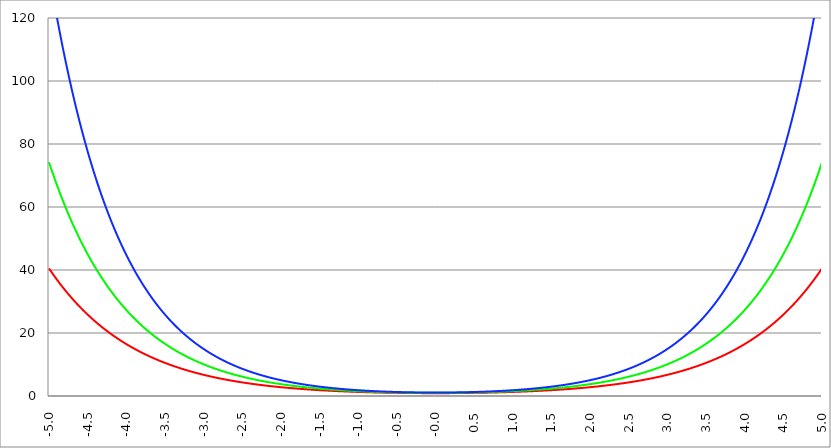
| Category | Series 1 | Series 0 | Series 2 |
|---|---|---|---|
| -5.0 | 40.513 | 74.21 | 134.583 |
| -4.995 | 40.331 | 73.84 | 133.845 |
| -4.99 | 40.15 | 73.472 | 133.111 |
| -4.985 | 39.97 | 73.105 | 132.38 |
| -4.98 | 39.79 | 72.741 | 131.654 |
| -4.975 | 39.612 | 72.378 | 130.932 |
| -4.97 | 39.434 | 72.017 | 130.214 |
| -4.965000000000001 | 39.257 | 71.658 | 129.5 |
| -4.960000000000001 | 39.081 | 71.3 | 128.79 |
| -4.955000000000001 | 38.905 | 70.945 | 128.083 |
| -4.950000000000001 | 38.73 | 70.591 | 127.381 |
| -4.945000000000001 | 38.557 | 70.239 | 126.682 |
| -4.940000000000001 | 38.384 | 69.889 | 125.987 |
| -4.935000000000001 | 38.211 | 69.54 | 125.296 |
| -4.930000000000001 | 38.04 | 69.193 | 124.609 |
| -4.925000000000002 | 37.869 | 68.848 | 123.926 |
| -4.920000000000002 | 37.699 | 68.505 | 123.246 |
| -4.915000000000002 | 37.53 | 68.163 | 122.57 |
| -4.910000000000002 | 37.361 | 67.823 | 121.898 |
| -4.905000000000002 | 37.194 | 67.485 | 121.229 |
| -4.900000000000002 | 37.027 | 67.149 | 120.564 |
| -4.895000000000002 | 36.861 | 66.814 | 119.903 |
| -4.890000000000002 | 36.695 | 66.481 | 119.245 |
| -4.885000000000002 | 36.53 | 66.149 | 118.591 |
| -4.880000000000002 | 36.366 | 65.819 | 117.941 |
| -4.875000000000003 | 36.203 | 65.491 | 117.294 |
| -4.870000000000003 | 36.041 | 65.164 | 116.651 |
| -4.865000000000003 | 35.879 | 64.839 | 116.011 |
| -4.860000000000003 | 35.718 | 64.516 | 115.375 |
| -4.855000000000003 | 35.558 | 64.194 | 114.742 |
| -4.850000000000003 | 35.398 | 63.874 | 114.113 |
| -4.845000000000003 | 35.239 | 63.556 | 113.487 |
| -4.840000000000003 | 35.081 | 63.239 | 112.864 |
| -4.835000000000003 | 34.923 | 62.923 | 112.245 |
| -4.830000000000004 | 34.767 | 62.609 | 111.63 |
| -4.825000000000004 | 34.611 | 62.297 | 111.017 |
| -4.820000000000004 | 34.455 | 61.987 | 110.409 |
| -4.815000000000004 | 34.301 | 61.677 | 109.803 |
| -4.810000000000004 | 34.147 | 61.37 | 109.201 |
| -4.805000000000004 | 33.993 | 61.064 | 108.602 |
| -4.800000000000004 | 33.841 | 60.759 | 108.006 |
| -4.795000000000004 | 33.689 | 60.456 | 107.414 |
| -4.790000000000004 | 33.538 | 60.155 | 106.825 |
| -4.785000000000004 | 33.387 | 59.855 | 106.239 |
| -4.780000000000004 | 33.237 | 59.556 | 105.656 |
| -4.775000000000004 | 33.088 | 59.259 | 105.077 |
| -4.770000000000004 | 32.94 | 58.964 | 104.5 |
| -4.765000000000005 | 32.792 | 58.67 | 103.927 |
| -4.760000000000005 | 32.645 | 58.377 | 103.357 |
| -4.755000000000005 | 32.498 | 58.086 | 102.79 |
| -4.750000000000005 | 32.352 | 57.796 | 102.227 |
| -4.745000000000005 | 32.207 | 57.508 | 101.666 |
| -4.740000000000005 | 32.063 | 57.221 | 101.108 |
| -4.735000000000005 | 31.919 | 56.936 | 100.554 |
| -4.730000000000005 | 31.775 | 56.652 | 100.002 |
| -4.725000000000006 | 31.633 | 56.37 | 99.454 |
| -4.720000000000006 | 31.491 | 56.089 | 98.908 |
| -4.715000000000006 | 31.35 | 55.809 | 98.366 |
| -4.710000000000006 | 31.209 | 55.531 | 97.826 |
| -4.705000000000006 | 31.069 | 55.254 | 97.29 |
| -4.700000000000006 | 30.929 | 54.978 | 96.756 |
| -4.695000000000006 | 30.79 | 54.704 | 96.226 |
| -4.690000000000006 | 30.652 | 54.431 | 95.698 |
| -4.685000000000007 | 30.515 | 54.16 | 95.173 |
| -4.680000000000007 | 30.378 | 53.89 | 94.651 |
| -4.675000000000007 | 30.241 | 53.621 | 94.132 |
| -4.670000000000007 | 30.106 | 53.354 | 93.616 |
| -4.665000000000007 | 29.971 | 53.088 | 93.102 |
| -4.660000000000007 | 29.836 | 52.823 | 92.592 |
| -4.655000000000007 | 29.702 | 52.559 | 92.084 |
| -4.650000000000007 | 29.569 | 52.297 | 91.579 |
| -4.645000000000007 | 29.436 | 52.036 | 91.076 |
| -4.640000000000008 | 29.304 | 51.777 | 90.577 |
| -4.635000000000008 | 29.173 | 51.519 | 90.08 |
| -4.630000000000008 | 29.042 | 51.262 | 89.586 |
| -4.625000000000008 | 28.911 | 51.006 | 89.095 |
| -4.620000000000008 | 28.782 | 50.752 | 88.606 |
| -4.615000000000008 | 28.652 | 50.499 | 88.12 |
| -4.610000000000008 | 28.524 | 50.247 | 87.637 |
| -4.605000000000008 | 28.396 | 49.996 | 87.156 |
| -4.600000000000008 | 28.268 | 49.747 | 86.678 |
| -4.595000000000009 | 28.142 | 49.499 | 86.203 |
| -4.590000000000009 | 28.015 | 49.252 | 85.73 |
| -4.585000000000009 | 27.89 | 49.007 | 85.26 |
| -4.580000000000009 | 27.764 | 48.762 | 84.792 |
| -4.57500000000001 | 27.64 | 48.519 | 84.327 |
| -4.57000000000001 | 27.516 | 48.277 | 83.865 |
| -4.565000000000009 | 27.392 | 48.037 | 83.405 |
| -4.560000000000009 | 27.269 | 47.797 | 82.947 |
| -4.555000000000009 | 27.147 | 47.559 | 82.493 |
| -4.55000000000001 | 27.025 | 47.321 | 82.04 |
| -4.54500000000001 | 26.904 | 47.086 | 81.59 |
| -4.54000000000001 | 26.783 | 46.851 | 81.143 |
| -4.53500000000001 | 26.663 | 46.617 | 80.698 |
| -4.53000000000001 | 26.543 | 46.385 | 80.255 |
| -4.52500000000001 | 26.424 | 46.153 | 79.815 |
| -4.52000000000001 | 26.306 | 45.923 | 79.377 |
| -4.51500000000001 | 26.188 | 45.694 | 78.942 |
| -4.51000000000001 | 26.07 | 45.466 | 78.509 |
| -4.505000000000011 | 25.953 | 45.24 | 78.078 |
| -4.500000000000011 | 25.837 | 45.014 | 77.65 |
| -4.495000000000011 | 25.721 | 44.79 | 77.224 |
| -4.490000000000011 | 25.605 | 44.566 | 76.801 |
| -4.485000000000011 | 25.49 | 44.344 | 76.38 |
| -4.480000000000011 | 25.376 | 44.123 | 75.961 |
| -4.475000000000011 | 25.262 | 43.903 | 75.544 |
| -4.470000000000011 | 25.149 | 43.684 | 75.13 |
| -4.465000000000011 | 25.036 | 43.466 | 74.718 |
| -4.460000000000011 | 24.924 | 43.25 | 74.308 |
| -4.455000000000012 | 24.812 | 43.034 | 73.9 |
| -4.450000000000012 | 24.701 | 42.819 | 73.495 |
| -4.445000000000012 | 24.59 | 42.606 | 73.092 |
| -4.440000000000012 | 24.479 | 42.393 | 72.691 |
| -4.435000000000012 | 24.37 | 42.182 | 72.293 |
| -4.430000000000012 | 24.26 | 41.972 | 71.896 |
| -4.425000000000012 | 24.151 | 41.762 | 71.502 |
| -4.420000000000012 | 24.043 | 41.554 | 71.11 |
| -4.415000000000012 | 23.935 | 41.347 | 70.72 |
| -4.410000000000013 | 23.828 | 41.141 | 70.332 |
| -4.405000000000013 | 23.721 | 40.936 | 69.946 |
| -4.400000000000013 | 23.614 | 40.732 | 69.562 |
| -4.395000000000013 | 23.508 | 40.528 | 69.181 |
| -4.390000000000013 | 23.403 | 40.326 | 68.802 |
| -4.385000000000013 | 23.298 | 40.125 | 68.424 |
| -4.380000000000013 | 23.193 | 39.925 | 68.049 |
| -4.375000000000013 | 23.089 | 39.726 | 67.676 |
| -4.370000000000013 | 22.986 | 39.528 | 67.305 |
| -4.365000000000013 | 22.883 | 39.331 | 66.936 |
| -4.360000000000014 | 22.78 | 39.135 | 66.568 |
| -4.355000000000014 | 22.678 | 38.94 | 66.203 |
| -4.350000000000014 | 22.576 | 38.746 | 65.84 |
| -4.345000000000014 | 22.475 | 38.553 | 65.479 |
| -4.340000000000014 | 22.374 | 38.36 | 65.12 |
| -4.335000000000014 | 22.274 | 38.169 | 64.763 |
| -4.330000000000014 | 22.174 | 37.979 | 64.408 |
| -4.325000000000014 | 22.074 | 37.789 | 64.055 |
| -4.320000000000014 | 21.975 | 37.601 | 63.703 |
| -4.315000000000015 | 21.877 | 37.413 | 63.354 |
| -4.310000000000015 | 21.778 | 37.227 | 63.007 |
| -4.305000000000015 | 21.681 | 37.041 | 62.661 |
| -4.300000000000015 | 21.583 | 36.857 | 62.317 |
| -4.295000000000015 | 21.487 | 36.673 | 61.976 |
| -4.290000000000015 | 21.39 | 36.49 | 61.636 |
| -4.285000000000015 | 21.294 | 36.308 | 61.298 |
| -4.280000000000015 | 21.199 | 36.127 | 60.962 |
| -4.275000000000015 | 21.104 | 35.947 | 60.627 |
| -4.270000000000015 | 21.009 | 35.768 | 60.295 |
| -4.265000000000016 | 20.915 | 35.589 | 59.964 |
| -4.260000000000016 | 20.821 | 35.412 | 59.635 |
| -4.255000000000016 | 20.728 | 35.236 | 59.308 |
| -4.250000000000016 | 20.635 | 35.06 | 58.983 |
| -4.245000000000016 | 20.542 | 34.885 | 58.66 |
| -4.240000000000016 | 20.45 | 34.711 | 58.338 |
| -4.235000000000016 | 20.358 | 34.538 | 58.018 |
| -4.230000000000016 | 20.267 | 34.366 | 57.7 |
| -4.225000000000017 | 20.176 | 34.195 | 57.383 |
| -4.220000000000017 | 20.085 | 34.024 | 57.069 |
| -4.215000000000017 | 19.995 | 33.854 | 56.756 |
| -4.210000000000017 | 19.906 | 33.686 | 56.445 |
| -4.205000000000017 | 19.816 | 33.518 | 56.135 |
| -4.200000000000017 | 19.727 | 33.351 | 55.827 |
| -4.195000000000017 | 19.639 | 33.184 | 55.521 |
| -4.190000000000017 | 19.551 | 33.019 | 55.217 |
| -4.185000000000017 | 19.463 | 32.854 | 54.914 |
| -4.180000000000017 | 19.376 | 32.691 | 54.613 |
| -4.175000000000018 | 19.289 | 32.528 | 54.313 |
| -4.170000000000018 | 19.203 | 32.365 | 54.015 |
| -4.165000000000018 | 19.116 | 32.204 | 53.719 |
| -4.160000000000018 | 19.031 | 32.044 | 53.424 |
| -4.155000000000018 | 18.945 | 31.884 | 53.132 |
| -4.150000000000018 | 18.86 | 31.725 | 52.84 |
| -4.145000000000018 | 18.776 | 31.567 | 52.55 |
| -4.140000000000018 | 18.692 | 31.409 | 52.262 |
| -4.135000000000018 | 18.608 | 31.253 | 51.976 |
| -4.130000000000019 | 18.524 | 31.097 | 51.691 |
| -4.125000000000019 | 18.441 | 30.942 | 51.407 |
| -4.120000000000019 | 18.359 | 30.788 | 51.125 |
| -4.115000000000019 | 18.276 | 30.634 | 50.845 |
| -4.110000000000019 | 18.194 | 30.482 | 50.566 |
| -4.105000000000019 | 18.113 | 30.33 | 50.289 |
| -4.100000000000019 | 18.031 | 30.178 | 50.013 |
| -4.095000000000019 | 17.951 | 30.028 | 49.739 |
| -4.090000000000019 | 17.87 | 29.878 | 49.466 |
| -4.085000000000019 | 17.79 | 29.729 | 49.195 |
| -4.08000000000002 | 17.71 | 29.581 | 48.925 |
| -4.07500000000002 | 17.631 | 29.434 | 48.657 |
| -4.07000000000002 | 17.552 | 29.287 | 48.39 |
| -4.06500000000002 | 17.473 | 29.141 | 48.125 |
| -4.06000000000002 | 17.395 | 28.996 | 47.861 |
| -4.05500000000002 | 17.317 | 28.851 | 47.598 |
| -4.05000000000002 | 17.239 | 28.707 | 47.337 |
| -4.04500000000002 | 17.162 | 28.564 | 47.078 |
| -4.04000000000002 | 17.085 | 28.422 | 46.82 |
| -4.03500000000002 | 17.008 | 28.28 | 46.563 |
| -4.03000000000002 | 16.932 | 28.139 | 46.308 |
| -4.025000000000021 | 16.856 | 27.999 | 46.054 |
| -4.020000000000021 | 16.78 | 27.86 | 45.801 |
| -4.015000000000021 | 16.705 | 27.721 | 45.55 |
| -4.010000000000021 | 16.63 | 27.583 | 45.3 |
| -4.005000000000021 | 16.556 | 27.445 | 45.052 |
| -4.000000000000021 | 16.482 | 27.308 | 44.805 |
| -3.995000000000021 | 16.408 | 27.172 | 44.559 |
| -3.990000000000021 | 16.334 | 27.037 | 44.315 |
| -3.985000000000022 | 16.261 | 26.902 | 44.072 |
| -3.980000000000022 | 16.188 | 26.768 | 43.83 |
| -3.975000000000022 | 16.115 | 26.634 | 43.59 |
| -3.970000000000022 | 16.043 | 26.502 | 43.351 |
| -3.965000000000022 | 15.971 | 26.37 | 43.113 |
| -3.960000000000022 | 15.9 | 26.238 | 42.877 |
| -3.955000000000022 | 15.828 | 26.107 | 42.642 |
| -3.950000000000022 | 15.757 | 25.977 | 42.408 |
| -3.945000000000022 | 15.687 | 25.848 | 42.175 |
| -3.940000000000023 | 15.616 | 25.719 | 41.944 |
| -3.935000000000023 | 15.546 | 25.591 | 41.714 |
| -3.930000000000023 | 15.477 | 25.463 | 41.485 |
| -3.925000000000023 | 15.407 | 25.336 | 41.258 |
| -3.920000000000023 | 15.338 | 25.21 | 41.032 |
| -3.915000000000023 | 15.27 | 25.085 | 40.807 |
| -3.910000000000023 | 15.201 | 24.959 | 40.583 |
| -3.905000000000023 | 15.133 | 24.835 | 40.36 |
| -3.900000000000023 | 15.065 | 24.711 | 40.139 |
| -3.895000000000023 | 14.998 | 24.588 | 39.919 |
| -3.890000000000024 | 14.93 | 24.466 | 39.7 |
| -3.885000000000024 | 14.864 | 24.344 | 39.482 |
| -3.880000000000024 | 14.797 | 24.222 | 39.266 |
| -3.875000000000024 | 14.731 | 24.102 | 39.051 |
| -3.870000000000024 | 14.665 | 23.982 | 38.837 |
| -3.865000000000024 | 14.599 | 23.862 | 38.624 |
| -3.860000000000024 | 14.533 | 23.743 | 38.412 |
| -3.855000000000024 | 14.468 | 23.625 | 38.201 |
| -3.850000000000024 | 14.403 | 23.507 | 37.992 |
| -3.845000000000025 | 14.339 | 23.39 | 37.784 |
| -3.840000000000025 | 14.275 | 23.273 | 37.576 |
| -3.835000000000025 | 14.211 | 23.158 | 37.37 |
| -3.830000000000025 | 14.147 | 23.042 | 37.166 |
| -3.825000000000025 | 14.084 | 22.927 | 36.962 |
| -3.820000000000025 | 14.021 | 22.813 | 36.759 |
| -3.815000000000025 | 13.958 | 22.699 | 36.558 |
| -3.810000000000025 | 13.895 | 22.586 | 36.357 |
| -3.805000000000025 | 13.833 | 22.474 | 36.158 |
| -3.800000000000026 | 13.771 | 22.362 | 35.96 |
| -3.795000000000026 | 13.709 | 22.25 | 35.762 |
| -3.790000000000026 | 13.648 | 22.139 | 35.566 |
| -3.785000000000026 | 13.587 | 22.029 | 35.371 |
| -3.780000000000026 | 13.526 | 21.919 | 35.178 |
| -3.775000000000026 | 13.465 | 21.81 | 34.985 |
| -3.770000000000026 | 13.405 | 21.702 | 34.793 |
| -3.765000000000026 | 13.345 | 21.593 | 34.602 |
| -3.760000000000026 | 13.285 | 21.486 | 34.412 |
| -3.755000000000026 | 13.226 | 21.379 | 34.224 |
| -3.750000000000027 | 13.166 | 21.272 | 34.036 |
| -3.745000000000027 | 13.107 | 21.166 | 33.85 |
| -3.740000000000027 | 13.049 | 21.061 | 33.664 |
| -3.735000000000027 | 12.99 | 20.956 | 33.479 |
| -3.730000000000027 | 12.932 | 20.852 | 33.296 |
| -3.725000000000027 | 12.874 | 20.748 | 33.113 |
| -3.720000000000027 | 12.816 | 20.644 | 32.932 |
| -3.715000000000027 | 12.759 | 20.541 | 32.751 |
| -3.710000000000027 | 12.702 | 20.439 | 32.572 |
| -3.705000000000028 | 12.645 | 20.337 | 32.393 |
| -3.700000000000028 | 12.588 | 20.236 | 32.216 |
| -3.695000000000028 | 12.532 | 20.135 | 32.039 |
| -3.690000000000028 | 12.476 | 20.035 | 31.863 |
| -3.685000000000028 | 12.42 | 19.935 | 31.689 |
| -3.680000000000028 | 12.364 | 19.836 | 31.515 |
| -3.675000000000028 | 12.309 | 19.737 | 31.342 |
| -3.670000000000028 | 12.254 | 19.639 | 31.171 |
| -3.665000000000028 | 12.199 | 19.541 | 31 |
| -3.660000000000028 | 12.144 | 19.444 | 30.83 |
| -3.655000000000029 | 12.09 | 19.347 | 30.661 |
| -3.650000000000029 | 12.036 | 19.25 | 30.493 |
| -3.645000000000029 | 11.982 | 19.154 | 30.326 |
| -3.640000000000029 | 11.928 | 19.059 | 30.159 |
| -3.635000000000029 | 11.875 | 18.964 | 29.994 |
| -3.630000000000029 | 11.822 | 18.87 | 29.83 |
| -3.625000000000029 | 11.769 | 18.776 | 29.666 |
| -3.620000000000029 | 11.716 | 18.682 | 29.504 |
| -3.615000000000029 | 11.664 | 18.589 | 29.342 |
| -3.61000000000003 | 11.612 | 18.497 | 29.181 |
| -3.60500000000003 | 11.56 | 18.404 | 29.021 |
| -3.60000000000003 | 11.508 | 18.313 | 28.862 |
| -3.59500000000003 | 11.456 | 18.222 | 28.704 |
| -3.59000000000003 | 11.405 | 18.131 | 28.547 |
| -3.58500000000003 | 11.354 | 18.041 | 28.39 |
| -3.58000000000003 | 11.303 | 17.951 | 28.234 |
| -3.57500000000003 | 11.253 | 17.861 | 28.08 |
| -3.57000000000003 | 11.202 | 17.772 | 27.926 |
| -3.565000000000031 | 11.152 | 17.684 | 27.773 |
| -3.560000000000031 | 11.102 | 17.596 | 27.621 |
| -3.555000000000031 | 11.052 | 17.508 | 27.469 |
| -3.550000000000031 | 11.003 | 17.421 | 27.319 |
| -3.545000000000031 | 10.954 | 17.334 | 27.169 |
| -3.540000000000031 | 10.905 | 17.248 | 27.02 |
| -3.535000000000031 | 10.856 | 17.162 | 26.872 |
| -3.530000000000031 | 10.807 | 17.077 | 26.725 |
| -3.525000000000031 | 10.759 | 16.992 | 26.578 |
| -3.520000000000032 | 10.711 | 16.907 | 26.433 |
| -3.515000000000032 | 10.663 | 16.823 | 26.288 |
| -3.510000000000032 | 10.615 | 16.739 | 26.144 |
| -3.505000000000032 | 10.568 | 16.656 | 26 |
| -3.500000000000032 | 10.521 | 16.573 | 25.858 |
| -3.495000000000032 | 10.473 | 16.49 | 25.716 |
| -3.490000000000032 | 10.427 | 16.408 | 25.575 |
| -3.485000000000032 | 10.38 | 16.327 | 25.435 |
| -3.480000000000032 | 10.334 | 16.245 | 25.296 |
| -3.475000000000032 | 10.287 | 16.164 | 25.157 |
| -3.470000000000033 | 10.241 | 16.084 | 25.019 |
| -3.465000000000033 | 10.195 | 16.004 | 24.882 |
| -3.460000000000033 | 10.15 | 15.924 | 24.746 |
| -3.455000000000033 | 10.105 | 15.845 | 24.61 |
| -3.450000000000033 | 10.059 | 15.766 | 24.475 |
| -3.445000000000033 | 10.014 | 15.688 | 24.341 |
| -3.440000000000033 | 9.97 | 15.61 | 24.208 |
| -3.435000000000033 | 9.925 | 15.532 | 24.075 |
| -3.430000000000033 | 9.881 | 15.455 | 23.943 |
| -3.425000000000034 | 9.836 | 15.378 | 23.812 |
| -3.420000000000034 | 9.792 | 15.301 | 23.682 |
| -3.415000000000034 | 9.749 | 15.225 | 23.552 |
| -3.410000000000034 | 9.705 | 15.149 | 23.423 |
| -3.405000000000034 | 9.662 | 15.074 | 23.295 |
| -3.400000000000034 | 9.619 | 14.999 | 23.167 |
| -3.395000000000034 | 9.576 | 14.924 | 23.04 |
| -3.390000000000034 | 9.533 | 14.85 | 22.914 |
| -3.385000000000034 | 9.49 | 14.776 | 22.788 |
| -3.380000000000034 | 9.448 | 14.702 | 22.663 |
| -3.375000000000035 | 9.405 | 14.629 | 22.539 |
| -3.370000000000035 | 9.363 | 14.556 | 22.416 |
| -3.365000000000035 | 9.322 | 14.484 | 22.293 |
| -3.360000000000035 | 9.28 | 14.412 | 22.171 |
| -3.355000000000035 | 9.238 | 14.34 | 22.049 |
| -3.350000000000035 | 9.197 | 14.269 | 21.929 |
| -3.345000000000035 | 9.156 | 14.198 | 21.808 |
| -3.340000000000035 | 9.115 | 14.127 | 21.689 |
| -3.335000000000035 | 9.074 | 14.057 | 21.57 |
| -3.330000000000036 | 9.034 | 13.987 | 21.452 |
| -3.325000000000036 | 8.994 | 13.917 | 21.335 |
| -3.320000000000036 | 8.953 | 13.848 | 21.218 |
| -3.315000000000036 | 8.913 | 13.779 | 21.101 |
| -3.310000000000036 | 8.874 | 13.711 | 20.986 |
| -3.305000000000036 | 8.834 | 13.643 | 20.871 |
| -3.300000000000036 | 8.794 | 13.575 | 20.757 |
| -3.295000000000036 | 8.755 | 13.507 | 20.643 |
| -3.290000000000036 | 8.716 | 13.44 | 20.53 |
| -3.285000000000036 | 8.677 | 13.373 | 20.417 |
| -3.280000000000036 | 8.638 | 13.307 | 20.306 |
| -3.275000000000037 | 8.6 | 13.241 | 20.194 |
| -3.270000000000037 | 8.561 | 13.175 | 20.084 |
| -3.265000000000037 | 8.523 | 13.109 | 19.974 |
| -3.260000000000037 | 8.485 | 13.044 | 19.864 |
| -3.255000000000037 | 8.447 | 12.979 | 19.756 |
| -3.250000000000037 | 8.41 | 12.915 | 19.647 |
| -3.245000000000037 | 8.372 | 12.85 | 19.54 |
| -3.240000000000037 | 8.335 | 12.786 | 19.433 |
| -3.235000000000038 | 8.297 | 12.723 | 19.326 |
| -3.230000000000038 | 8.26 | 12.66 | 19.221 |
| -3.225000000000038 | 8.224 | 12.597 | 19.115 |
| -3.220000000000038 | 8.187 | 12.534 | 19.011 |
| -3.215000000000038 | 8.15 | 12.472 | 18.907 |
| -3.210000000000038 | 8.114 | 12.41 | 18.803 |
| -3.205000000000038 | 8.078 | 12.348 | 18.7 |
| -3.200000000000038 | 8.042 | 12.287 | 18.598 |
| -3.195000000000038 | 8.006 | 12.226 | 18.496 |
| -3.190000000000039 | 7.97 | 12.165 | 18.395 |
| -3.185000000000039 | 7.935 | 12.104 | 18.294 |
| -3.180000000000039 | 7.899 | 12.044 | 18.194 |
| -3.175000000000039 | 7.864 | 11.984 | 18.094 |
| -3.170000000000039 | 7.829 | 11.925 | 17.995 |
| -3.16500000000004 | 7.794 | 11.865 | 17.897 |
| -3.16000000000004 | 7.759 | 11.807 | 17.799 |
| -3.155000000000039 | 7.725 | 11.748 | 17.701 |
| -3.150000000000039 | 7.69 | 11.689 | 17.604 |
| -3.14500000000004 | 7.656 | 11.631 | 17.508 |
| -3.14000000000004 | 7.622 | 11.574 | 17.412 |
| -3.13500000000004 | 7.588 | 11.516 | 17.317 |
| -3.13000000000004 | 7.554 | 11.459 | 17.222 |
| -3.12500000000004 | 7.52 | 11.402 | 17.128 |
| -3.12000000000004 | 7.487 | 11.345 | 17.034 |
| -3.11500000000004 | 7.453 | 11.289 | 16.941 |
| -3.11000000000004 | 7.42 | 11.233 | 16.848 |
| -3.10500000000004 | 7.387 | 11.177 | 16.756 |
| -3.10000000000004 | 7.354 | 11.122 | 16.664 |
| -3.095000000000041 | 7.321 | 11.066 | 16.573 |
| -3.090000000000041 | 7.289 | 11.011 | 16.482 |
| -3.085000000000041 | 7.256 | 10.957 | 16.392 |
| -3.080000000000041 | 7.224 | 10.902 | 16.302 |
| -3.075000000000041 | 7.192 | 10.848 | 16.213 |
| -3.070000000000041 | 7.16 | 10.794 | 16.124 |
| -3.065000000000041 | 7.128 | 10.741 | 16.036 |
| -3.060000000000041 | 7.096 | 10.687 | 15.948 |
| -3.055000000000041 | 7.064 | 10.634 | 15.861 |
| -3.050000000000042 | 7.033 | 10.581 | 15.774 |
| -3.045000000000042 | 7.002 | 10.529 | 15.688 |
| -3.040000000000042 | 6.97 | 10.477 | 15.602 |
| -3.035000000000042 | 6.939 | 10.425 | 15.517 |
| -3.030000000000042 | 6.909 | 10.373 | 15.432 |
| -3.025000000000042 | 6.878 | 10.321 | 15.347 |
| -3.020000000000042 | 6.847 | 10.27 | 15.263 |
| -3.015000000000042 | 6.817 | 10.219 | 15.18 |
| -3.010000000000042 | 6.786 | 10.168 | 15.097 |
| -3.005000000000043 | 6.756 | 10.118 | 15.014 |
| -3.000000000000043 | 6.726 | 10.068 | 14.932 |
| -2.995000000000043 | 6.696 | 10.018 | 14.851 |
| -2.990000000000043 | 6.666 | 9.968 | 14.769 |
| -2.985000000000043 | 6.637 | 9.919 | 14.689 |
| -2.980000000000043 | 6.607 | 9.869 | 14.608 |
| -2.975000000000043 | 6.578 | 9.82 | 14.528 |
| -2.970000000000043 | 6.549 | 9.772 | 14.449 |
| -2.965000000000043 | 6.519 | 9.723 | 14.37 |
| -2.960000000000043 | 6.49 | 9.675 | 14.291 |
| -2.955000000000044 | 6.462 | 9.627 | 14.213 |
| -2.950000000000044 | 6.433 | 9.579 | 14.135 |
| -2.945000000000044 | 6.404 | 9.532 | 14.058 |
| -2.940000000000044 | 6.376 | 9.484 | 13.981 |
| -2.935000000000044 | 6.347 | 9.437 | 13.905 |
| -2.930000000000044 | 6.319 | 9.391 | 13.829 |
| -2.925000000000044 | 6.291 | 9.344 | 13.753 |
| -2.920000000000044 | 6.263 | 9.298 | 13.678 |
| -2.915000000000044 | 6.235 | 9.252 | 13.603 |
| -2.910000000000045 | 6.208 | 9.206 | 13.529 |
| -2.905000000000045 | 6.18 | 9.16 | 13.455 |
| -2.900000000000045 | 6.153 | 9.115 | 13.381 |
| -2.895000000000045 | 6.125 | 9.069 | 13.308 |
| -2.890000000000045 | 6.098 | 9.024 | 13.235 |
| -2.885000000000045 | 6.071 | 8.98 | 13.163 |
| -2.880000000000045 | 6.044 | 8.935 | 13.091 |
| -2.875000000000045 | 6.017 | 8.891 | 13.02 |
| -2.870000000000045 | 5.991 | 8.847 | 12.948 |
| -2.865000000000045 | 5.964 | 8.803 | 12.878 |
| -2.860000000000046 | 5.937 | 8.759 | 12.807 |
| -2.855000000000046 | 5.911 | 8.716 | 12.737 |
| -2.850000000000046 | 5.885 | 8.673 | 12.668 |
| -2.845000000000046 | 5.859 | 8.63 | 12.598 |
| -2.840000000000046 | 5.833 | 8.587 | 12.53 |
| -2.835000000000046 | 5.807 | 8.545 | 12.461 |
| -2.830000000000046 | 5.781 | 8.502 | 12.393 |
| -2.825000000000046 | 5.756 | 8.46 | 12.325 |
| -2.820000000000046 | 5.73 | 8.418 | 12.258 |
| -2.815000000000047 | 5.705 | 8.377 | 12.191 |
| -2.810000000000047 | 5.679 | 8.335 | 12.124 |
| -2.805000000000047 | 5.654 | 8.294 | 12.058 |
| -2.800000000000047 | 5.629 | 8.253 | 11.992 |
| -2.795000000000047 | 5.604 | 8.212 | 11.927 |
| -2.790000000000047 | 5.579 | 8.171 | 11.862 |
| -2.785000000000047 | 5.555 | 8.131 | 11.797 |
| -2.780000000000047 | 5.53 | 8.091 | 11.733 |
| -2.775000000000047 | 5.505 | 8.05 | 11.668 |
| -2.770000000000047 | 5.481 | 8.011 | 11.605 |
| -2.765000000000048 | 5.457 | 7.971 | 11.541 |
| -2.760000000000048 | 5.433 | 7.932 | 11.478 |
| -2.755000000000048 | 5.409 | 7.892 | 11.416 |
| -2.750000000000048 | 5.385 | 7.853 | 11.353 |
| -2.745000000000048 | 5.361 | 7.814 | 11.291 |
| -2.740000000000048 | 5.337 | 7.776 | 11.23 |
| -2.735000000000048 | 5.313 | 7.737 | 11.168 |
| -2.730000000000048 | 5.29 | 7.699 | 11.108 |
| -2.725000000000048 | 5.267 | 7.661 | 11.047 |
| -2.720000000000049 | 5.243 | 7.623 | 10.987 |
| -2.715000000000049 | 5.22 | 7.585 | 10.927 |
| -2.710000000000049 | 5.197 | 7.548 | 10.867 |
| -2.705000000000049 | 5.174 | 7.511 | 10.808 |
| -2.700000000000049 | 5.151 | 7.473 | 10.749 |
| -2.695000000000049 | 5.128 | 7.437 | 10.69 |
| -2.690000000000049 | 5.106 | 7.4 | 10.632 |
| -2.685000000000049 | 5.083 | 7.363 | 10.574 |
| -2.680000000000049 | 5.061 | 7.327 | 10.516 |
| -2.675000000000049 | 5.038 | 7.291 | 10.459 |
| -2.67000000000005 | 5.016 | 7.255 | 10.402 |
| -2.66500000000005 | 4.994 | 7.219 | 10.345 |
| -2.66000000000005 | 4.972 | 7.183 | 10.289 |
| -2.65500000000005 | 4.95 | 7.148 | 10.232 |
| -2.65000000000005 | 4.928 | 7.112 | 10.177 |
| -2.64500000000005 | 4.906 | 7.077 | 10.121 |
| -2.64000000000005 | 4.885 | 7.042 | 10.066 |
| -2.63500000000005 | 4.863 | 7.008 | 10.011 |
| -2.63000000000005 | 4.842 | 6.973 | 9.957 |
| -2.625000000000051 | 4.82 | 6.939 | 9.902 |
| -2.620000000000051 | 4.799 | 6.904 | 9.848 |
| -2.615000000000051 | 4.778 | 6.87 | 9.795 |
| -2.610000000000051 | 4.757 | 6.836 | 9.741 |
| -2.605000000000051 | 4.736 | 6.803 | 9.688 |
| -2.600000000000051 | 4.715 | 6.769 | 9.635 |
| -2.595000000000051 | 4.694 | 6.736 | 9.583 |
| -2.590000000000051 | 4.673 | 6.702 | 9.531 |
| -2.585000000000051 | 4.653 | 6.669 | 9.479 |
| -2.580000000000052 | 4.632 | 6.636 | 9.427 |
| -2.575000000000052 | 4.612 | 6.604 | 9.376 |
| -2.570000000000052 | 4.592 | 6.571 | 9.325 |
| -2.565000000000052 | 4.571 | 6.539 | 9.274 |
| -2.560000000000052 | 4.551 | 6.507 | 9.223 |
| -2.555000000000052 | 4.531 | 6.474 | 9.173 |
| -2.550000000000052 | 4.511 | 6.443 | 9.123 |
| -2.545000000000052 | 4.491 | 6.411 | 9.073 |
| -2.540000000000052 | 4.472 | 6.379 | 9.024 |
| -2.535000000000053 | 4.452 | 6.348 | 8.975 |
| -2.530000000000053 | 4.432 | 6.317 | 8.926 |
| -2.525000000000053 | 4.413 | 6.285 | 8.878 |
| -2.520000000000053 | 4.394 | 6.255 | 8.829 |
| -2.515000000000053 | 4.374 | 6.224 | 8.781 |
| -2.510000000000053 | 4.355 | 6.193 | 8.733 |
| -2.505000000000053 | 4.336 | 6.163 | 8.686 |
| -2.500000000000053 | 4.317 | 6.132 | 8.639 |
| -2.495000000000053 | 4.298 | 6.102 | 8.592 |
| -2.490000000000053 | 4.279 | 6.072 | 8.545 |
| -2.485000000000054 | 4.26 | 6.042 | 8.498 |
| -2.480000000000054 | 4.242 | 6.013 | 8.452 |
| -2.475000000000054 | 4.223 | 5.983 | 8.406 |
| -2.470000000000054 | 4.204 | 5.954 | 8.361 |
| -2.465000000000054 | 4.186 | 5.924 | 8.315 |
| -2.460000000000054 | 4.168 | 5.895 | 8.27 |
| -2.455000000000054 | 4.149 | 5.866 | 8.225 |
| -2.450000000000054 | 4.131 | 5.837 | 8.18 |
| -2.445000000000054 | 4.113 | 5.809 | 8.136 |
| -2.440000000000055 | 4.095 | 5.78 | 8.092 |
| -2.435000000000055 | 4.077 | 5.752 | 8.048 |
| -2.430000000000055 | 4.059 | 5.723 | 8.004 |
| -2.425000000000055 | 4.042 | 5.695 | 7.96 |
| -2.420000000000055 | 4.024 | 5.667 | 7.917 |
| -2.415000000000055 | 4.006 | 5.64 | 7.874 |
| -2.410000000000055 | 3.989 | 5.612 | 7.831 |
| -2.405000000000055 | 3.971 | 5.584 | 7.789 |
| -2.400000000000055 | 3.954 | 5.557 | 7.747 |
| -2.395000000000055 | 3.937 | 5.53 | 7.704 |
| -2.390000000000056 | 3.919 | 5.503 | 7.663 |
| -2.385000000000056 | 3.902 | 5.476 | 7.621 |
| -2.380000000000056 | 3.885 | 5.449 | 7.58 |
| -2.375000000000056 | 3.868 | 5.422 | 7.539 |
| -2.370000000000056 | 3.851 | 5.395 | 7.498 |
| -2.365000000000056 | 3.835 | 5.369 | 7.457 |
| -2.360000000000056 | 3.818 | 5.343 | 7.417 |
| -2.355000000000056 | 3.801 | 5.317 | 7.376 |
| -2.350000000000056 | 3.785 | 5.29 | 7.336 |
| -2.345000000000057 | 3.768 | 5.265 | 7.296 |
| -2.340000000000057 | 3.752 | 5.239 | 7.257 |
| -2.335000000000057 | 3.735 | 5.213 | 7.218 |
| -2.330000000000057 | 3.719 | 5.188 | 7.178 |
| -2.325000000000057 | 3.703 | 5.162 | 7.14 |
| -2.320000000000057 | 3.687 | 5.137 | 7.101 |
| -2.315000000000057 | 3.671 | 5.112 | 7.062 |
| -2.310000000000057 | 3.655 | 5.087 | 7.024 |
| -2.305000000000057 | 3.639 | 5.062 | 6.986 |
| -2.300000000000058 | 3.623 | 5.037 | 6.948 |
| -2.295000000000058 | 3.607 | 5.013 | 6.911 |
| -2.290000000000058 | 3.592 | 4.988 | 6.873 |
| -2.285000000000058 | 3.576 | 4.964 | 6.836 |
| -2.280000000000058 | 3.56 | 4.939 | 6.799 |
| -2.275000000000058 | 3.545 | 4.915 | 6.762 |
| -2.270000000000058 | 3.53 | 4.891 | 6.726 |
| -2.265000000000058 | 3.514 | 4.867 | 6.689 |
| -2.260000000000058 | 3.499 | 4.844 | 6.653 |
| -2.255000000000058 | 3.484 | 4.82 | 6.617 |
| -2.250000000000059 | 3.469 | 4.797 | 6.581 |
| -2.245000000000059 | 3.454 | 4.773 | 6.546 |
| -2.240000000000059 | 3.439 | 4.75 | 6.51 |
| -2.235000000000059 | 3.424 | 4.727 | 6.475 |
| -2.23000000000006 | 3.409 | 4.704 | 6.44 |
| -2.22500000000006 | 3.394 | 4.681 | 6.405 |
| -2.22000000000006 | 3.379 | 4.658 | 6.371 |
| -2.215000000000059 | 3.365 | 4.635 | 6.336 |
| -2.210000000000059 | 3.35 | 4.613 | 6.302 |
| -2.20500000000006 | 3.336 | 4.59 | 6.268 |
| -2.20000000000006 | 3.321 | 4.568 | 6.234 |
| -2.19500000000006 | 3.307 | 4.546 | 6.2 |
| -2.19000000000006 | 3.293 | 4.524 | 6.167 |
| -2.18500000000006 | 3.279 | 4.502 | 6.134 |
| -2.18000000000006 | 3.264 | 4.48 | 6.101 |
| -2.17500000000006 | 3.25 | 4.458 | 6.068 |
| -2.17000000000006 | 3.236 | 4.436 | 6.035 |
| -2.16500000000006 | 3.222 | 4.415 | 6.002 |
| -2.160000000000061 | 3.208 | 4.393 | 5.97 |
| -2.155000000000061 | 3.195 | 4.372 | 5.938 |
| -2.150000000000061 | 3.181 | 4.351 | 5.906 |
| -2.145000000000061 | 3.167 | 4.33 | 5.874 |
| -2.140000000000061 | 3.153 | 4.309 | 5.842 |
| -2.135000000000061 | 3.14 | 4.288 | 5.811 |
| -2.130000000000061 | 3.126 | 4.267 | 5.78 |
| -2.125000000000061 | 3.113 | 4.246 | 5.749 |
| -2.120000000000061 | 3.1 | 4.226 | 5.718 |
| -2.115000000000061 | 3.086 | 4.205 | 5.687 |
| -2.110000000000062 | 3.073 | 4.185 | 5.656 |
| -2.105000000000062 | 3.06 | 4.164 | 5.626 |
| -2.100000000000062 | 3.047 | 4.144 | 5.596 |
| -2.095000000000062 | 3.034 | 4.124 | 5.565 |
| -2.090000000000062 | 3.021 | 4.104 | 5.536 |
| -2.085000000000062 | 3.008 | 4.084 | 5.506 |
| -2.080000000000062 | 2.995 | 4.065 | 5.476 |
| -2.075000000000062 | 2.982 | 4.045 | 5.447 |
| -2.070000000000062 | 2.969 | 4.026 | 5.417 |
| -2.065000000000063 | 2.957 | 4.006 | 5.388 |
| -2.060000000000063 | 2.944 | 3.987 | 5.359 |
| -2.055000000000063 | 2.931 | 3.967 | 5.331 |
| -2.050000000000063 | 2.919 | 3.948 | 5.302 |
| -2.045000000000063 | 2.906 | 3.929 | 5.274 |
| -2.040000000000063 | 2.894 | 3.91 | 5.245 |
| -2.035000000000063 | 2.882 | 3.891 | 5.217 |
| -2.030000000000063 | 2.869 | 3.873 | 5.189 |
| -2.025000000000063 | 2.857 | 3.854 | 5.161 |
| -2.020000000000064 | 2.845 | 3.835 | 5.134 |
| -2.015000000000064 | 2.833 | 3.817 | 5.106 |
| -2.010000000000064 | 2.821 | 3.799 | 5.079 |
| -2.005000000000064 | 2.809 | 3.78 | 5.052 |
| -2.000000000000064 | 2.797 | 3.762 | 5.025 |
| -1.995000000000064 | 2.785 | 3.744 | 4.998 |
| -1.990000000000064 | 2.773 | 3.726 | 4.971 |
| -1.985000000000064 | 2.761 | 3.708 | 4.944 |
| -1.980000000000064 | 2.75 | 3.69 | 4.918 |
| -1.975000000000064 | 2.738 | 3.673 | 4.892 |
| -1.970000000000065 | 2.726 | 3.655 | 4.866 |
| -1.965000000000065 | 2.715 | 3.638 | 4.84 |
| -1.960000000000065 | 2.703 | 3.62 | 4.814 |
| -1.955000000000065 | 2.692 | 3.603 | 4.788 |
| -1.950000000000065 | 2.68 | 3.585 | 4.763 |
| -1.945000000000065 | 2.669 | 3.568 | 4.737 |
| -1.940000000000065 | 2.658 | 3.551 | 4.712 |
| -1.935000000000065 | 2.647 | 3.534 | 4.687 |
| -1.930000000000065 | 2.635 | 3.517 | 4.662 |
| -1.925000000000066 | 2.624 | 3.501 | 4.637 |
| -1.920000000000066 | 2.613 | 3.484 | 4.612 |
| -1.915000000000066 | 2.602 | 3.467 | 4.588 |
| -1.910000000000066 | 2.591 | 3.451 | 4.563 |
| -1.905000000000066 | 2.58 | 3.434 | 4.539 |
| -1.900000000000066 | 2.569 | 3.418 | 4.515 |
| -1.895000000000066 | 2.559 | 3.401 | 4.491 |
| -1.890000000000066 | 2.548 | 3.385 | 4.467 |
| -1.885000000000066 | 2.537 | 3.369 | 4.443 |
| -1.880000000000066 | 2.527 | 3.353 | 4.419 |
| -1.875000000000067 | 2.516 | 3.337 | 4.396 |
| -1.870000000000067 | 2.505 | 3.321 | 4.373 |
| -1.865000000000067 | 2.495 | 3.305 | 4.349 |
| -1.860000000000067 | 2.484 | 3.29 | 4.326 |
| -1.855000000000067 | 2.474 | 3.274 | 4.303 |
| -1.850000000000067 | 2.464 | 3.259 | 4.281 |
| -1.845000000000067 | 2.453 | 3.243 | 4.258 |
| -1.840000000000067 | 2.443 | 3.228 | 4.235 |
| -1.835000000000067 | 2.433 | 3.212 | 4.213 |
| -1.830000000000068 | 2.423 | 3.197 | 4.191 |
| -1.825000000000068 | 2.413 | 3.182 | 4.168 |
| -1.820000000000068 | 2.403 | 3.167 | 4.146 |
| -1.815000000000068 | 2.393 | 3.152 | 4.124 |
| -1.810000000000068 | 2.383 | 3.137 | 4.103 |
| -1.805000000000068 | 2.373 | 3.122 | 4.081 |
| -1.800000000000068 | 2.363 | 3.107 | 4.059 |
| -1.795000000000068 | 2.353 | 3.093 | 4.038 |
| -1.790000000000068 | 2.343 | 3.078 | 4.017 |
| -1.785000000000068 | 2.334 | 3.064 | 3.996 |
| -1.780000000000069 | 2.324 | 3.049 | 3.974 |
| -1.775000000000069 | 2.314 | 3.035 | 3.954 |
| -1.770000000000069 | 2.305 | 3.021 | 3.933 |
| -1.765000000000069 | 2.295 | 3.006 | 3.912 |
| -1.760000000000069 | 2.286 | 2.992 | 3.891 |
| -1.75500000000007 | 2.276 | 2.978 | 3.871 |
| -1.75000000000007 | 2.267 | 2.964 | 3.851 |
| -1.745000000000069 | 2.258 | 2.95 | 3.83 |
| -1.740000000000069 | 2.248 | 2.936 | 3.81 |
| -1.73500000000007 | 2.239 | 2.923 | 3.79 |
| -1.73000000000007 | 2.23 | 2.909 | 3.77 |
| -1.72500000000007 | 2.221 | 2.895 | 3.751 |
| -1.72000000000007 | 2.212 | 2.882 | 3.731 |
| -1.71500000000007 | 2.203 | 2.868 | 3.711 |
| -1.71000000000007 | 2.194 | 2.855 | 3.692 |
| -1.70500000000007 | 2.185 | 2.842 | 3.673 |
| -1.70000000000007 | 2.176 | 2.828 | 3.653 |
| -1.69500000000007 | 2.167 | 2.815 | 3.634 |
| -1.69000000000007 | 2.158 | 2.802 | 3.615 |
| -1.685000000000071 | 2.149 | 2.789 | 3.596 |
| -1.680000000000071 | 2.14 | 2.776 | 3.578 |
| -1.675000000000071 | 2.132 | 2.763 | 3.559 |
| -1.670000000000071 | 2.123 | 2.75 | 3.54 |
| -1.665000000000071 | 2.114 | 2.737 | 3.522 |
| -1.660000000000071 | 2.106 | 2.725 | 3.504 |
| -1.655000000000071 | 2.097 | 2.712 | 3.485 |
| -1.650000000000071 | 2.089 | 2.7 | 3.467 |
| -1.645000000000071 | 2.08 | 2.687 | 3.449 |
| -1.640000000000072 | 2.072 | 2.675 | 3.431 |
| -1.635000000000072 | 2.063 | 2.662 | 3.413 |
| -1.630000000000072 | 2.055 | 2.65 | 3.396 |
| -1.625000000000072 | 2.047 | 2.638 | 3.378 |
| -1.620000000000072 | 2.039 | 2.625 | 3.361 |
| -1.615000000000072 | 2.03 | 2.613 | 3.343 |
| -1.610000000000072 | 2.022 | 2.601 | 3.326 |
| -1.605000000000072 | 2.014 | 2.589 | 3.309 |
| -1.600000000000072 | 2.006 | 2.577 | 3.291 |
| -1.595000000000073 | 1.998 | 2.566 | 3.274 |
| -1.590000000000073 | 1.99 | 2.554 | 3.258 |
| -1.585000000000073 | 1.982 | 2.542 | 3.241 |
| -1.580000000000073 | 1.974 | 2.53 | 3.224 |
| -1.575000000000073 | 1.966 | 2.519 | 3.207 |
| -1.570000000000073 | 1.958 | 2.507 | 3.191 |
| -1.565000000000073 | 1.95 | 2.496 | 3.174 |
| -1.560000000000073 | 1.943 | 2.484 | 3.158 |
| -1.555000000000073 | 1.935 | 2.473 | 3.142 |
| -1.550000000000074 | 1.927 | 2.462 | 3.126 |
| -1.545000000000074 | 1.92 | 2.451 | 3.11 |
| -1.540000000000074 | 1.912 | 2.439 | 3.094 |
| -1.535000000000074 | 1.904 | 2.428 | 3.078 |
| -1.530000000000074 | 1.897 | 2.417 | 3.062 |
| -1.525000000000074 | 1.889 | 2.406 | 3.046 |
| -1.520000000000074 | 1.882 | 2.395 | 3.031 |
| -1.515000000000074 | 1.875 | 2.385 | 3.015 |
| -1.510000000000074 | 1.867 | 2.374 | 3 |
| -1.505000000000074 | 1.86 | 2.363 | 2.985 |
| -1.500000000000075 | 1.852 | 2.352 | 2.969 |
| -1.495000000000075 | 1.845 | 2.342 | 2.954 |
| -1.490000000000075 | 1.838 | 2.331 | 2.939 |
| -1.485000000000075 | 1.831 | 2.321 | 2.924 |
| -1.480000000000075 | 1.824 | 2.31 | 2.909 |
| -1.475000000000075 | 1.817 | 2.3 | 2.895 |
| -1.470000000000075 | 1.809 | 2.29 | 2.88 |
| -1.465000000000075 | 1.802 | 2.279 | 2.865 |
| -1.460000000000075 | 1.795 | 2.269 | 2.851 |
| -1.455000000000076 | 1.788 | 2.259 | 2.837 |
| -1.450000000000076 | 1.781 | 2.249 | 2.822 |
| -1.445000000000076 | 1.775 | 2.239 | 2.808 |
| -1.440000000000076 | 1.768 | 2.229 | 2.794 |
| -1.435000000000076 | 1.761 | 2.219 | 2.78 |
| -1.430000000000076 | 1.754 | 2.209 | 2.766 |
| -1.425000000000076 | 1.747 | 2.199 | 2.752 |
| -1.420000000000076 | 1.741 | 2.189 | 2.738 |
| -1.415000000000076 | 1.734 | 2.18 | 2.724 |
| -1.410000000000077 | 1.727 | 2.17 | 2.711 |
| -1.405000000000077 | 1.721 | 2.16 | 2.697 |
| -1.400000000000077 | 1.714 | 2.151 | 2.683 |
| -1.395000000000077 | 1.708 | 2.141 | 2.67 |
| -1.390000000000077 | 1.701 | 2.132 | 2.657 |
| -1.385000000000077 | 1.695 | 2.123 | 2.643 |
| -1.380000000000077 | 1.688 | 2.113 | 2.63 |
| -1.375000000000077 | 1.682 | 2.104 | 2.617 |
| -1.370000000000077 | 1.675 | 2.095 | 2.604 |
| -1.365000000000077 | 1.669 | 2.086 | 2.591 |
| -1.360000000000078 | 1.663 | 2.076 | 2.578 |
| -1.355000000000078 | 1.656 | 2.067 | 2.566 |
| -1.350000000000078 | 1.65 | 2.058 | 2.553 |
| -1.345000000000078 | 1.644 | 2.049 | 2.54 |
| -1.340000000000078 | 1.638 | 2.04 | 2.528 |
| -1.335000000000078 | 1.632 | 2.032 | 2.515 |
| -1.330000000000078 | 1.626 | 2.023 | 2.503 |
| -1.325000000000078 | 1.619 | 2.014 | 2.49 |
| -1.320000000000078 | 1.613 | 2.005 | 2.478 |
| -1.315000000000079 | 1.607 | 1.997 | 2.466 |
| -1.310000000000079 | 1.601 | 1.988 | 2.454 |
| -1.305000000000079 | 1.595 | 1.979 | 2.442 |
| -1.300000000000079 | 1.59 | 1.971 | 2.43 |
| -1.295000000000079 | 1.584 | 1.962 | 2.418 |
| -1.29000000000008 | 1.578 | 1.954 | 2.406 |
| -1.285000000000079 | 1.572 | 1.946 | 2.394 |
| -1.280000000000079 | 1.566 | 1.937 | 2.383 |
| -1.275000000000079 | 1.56 | 1.929 | 2.371 |
| -1.270000000000079 | 1.555 | 1.921 | 2.36 |
| -1.26500000000008 | 1.549 | 1.913 | 2.348 |
| -1.26000000000008 | 1.543 | 1.905 | 2.337 |
| -1.25500000000008 | 1.538 | 1.896 | 2.326 |
| -1.25000000000008 | 1.532 | 1.888 | 2.314 |
| -1.24500000000008 | 1.527 | 1.88 | 2.303 |
| -1.24000000000008 | 1.521 | 1.872 | 2.292 |
| -1.23500000000008 | 1.516 | 1.865 | 2.281 |
| -1.23000000000008 | 1.51 | 1.857 | 2.27 |
| -1.22500000000008 | 1.505 | 1.849 | 2.259 |
| -1.220000000000081 | 1.499 | 1.841 | 2.248 |
| -1.215000000000081 | 1.494 | 1.834 | 2.238 |
| -1.210000000000081 | 1.489 | 1.826 | 2.227 |
| -1.205000000000081 | 1.483 | 1.818 | 2.216 |
| -1.200000000000081 | 1.478 | 1.811 | 2.206 |
| -1.195000000000081 | 1.473 | 1.803 | 2.195 |
| -1.190000000000081 | 1.467 | 1.796 | 2.185 |
| -1.185000000000081 | 1.462 | 1.788 | 2.175 |
| -1.180000000000081 | 1.457 | 1.781 | 2.164 |
| -1.175000000000082 | 1.452 | 1.773 | 2.154 |
| -1.170000000000082 | 1.447 | 1.766 | 2.144 |
| -1.165000000000082 | 1.442 | 1.759 | 2.134 |
| -1.160000000000082 | 1.437 | 1.752 | 2.124 |
| -1.155000000000082 | 1.432 | 1.745 | 2.114 |
| -1.150000000000082 | 1.427 | 1.737 | 2.104 |
| -1.145000000000082 | 1.422 | 1.73 | 2.094 |
| -1.140000000000082 | 1.417 | 1.723 | 2.084 |
| -1.135000000000082 | 1.412 | 1.716 | 2.075 |
| -1.130000000000082 | 1.407 | 1.709 | 2.065 |
| -1.125000000000083 | 1.402 | 1.702 | 2.055 |
| -1.120000000000083 | 1.397 | 1.696 | 2.046 |
| -1.115000000000083 | 1.392 | 1.689 | 2.036 |
| -1.110000000000083 | 1.388 | 1.682 | 2.027 |
| -1.105000000000083 | 1.383 | 1.675 | 2.018 |
| -1.100000000000083 | 1.378 | 1.669 | 2.008 |
| -1.095000000000083 | 1.374 | 1.662 | 1.999 |
| -1.090000000000083 | 1.369 | 1.655 | 1.99 |
| -1.085000000000083 | 1.364 | 1.649 | 1.981 |
| -1.080000000000084 | 1.36 | 1.642 | 1.972 |
| -1.075000000000084 | 1.355 | 1.636 | 1.963 |
| -1.070000000000084 | 1.351 | 1.629 | 1.954 |
| -1.065000000000084 | 1.346 | 1.623 | 1.945 |
| -1.060000000000084 | 1.342 | 1.616 | 1.936 |
| -1.055000000000084 | 1.337 | 1.61 | 1.928 |
| -1.050000000000084 | 1.333 | 1.604 | 1.919 |
| -1.045000000000084 | 1.328 | 1.598 | 1.91 |
| -1.040000000000084 | 1.324 | 1.591 | 1.902 |
| -1.035000000000085 | 1.32 | 1.585 | 1.893 |
| -1.030000000000085 | 1.315 | 1.579 | 1.885 |
| -1.025000000000085 | 1.311 | 1.573 | 1.876 |
| -1.020000000000085 | 1.307 | 1.567 | 1.868 |
| -1.015000000000085 | 1.302 | 1.561 | 1.86 |
| -1.010000000000085 | 1.298 | 1.555 | 1.852 |
| -1.005000000000085 | 1.294 | 1.549 | 1.843 |
| -1.000000000000085 | 1.29 | 1.543 | 1.835 |
| -0.995000000000085 | 1.286 | 1.537 | 1.827 |
| -0.990000000000085 | 1.282 | 1.531 | 1.819 |
| -0.985000000000085 | 1.277 | 1.526 | 1.811 |
| -0.980000000000085 | 1.273 | 1.52 | 1.803 |
| -0.975000000000085 | 1.269 | 1.514 | 1.796 |
| -0.970000000000085 | 1.265 | 1.509 | 1.788 |
| -0.965000000000085 | 1.261 | 1.503 | 1.78 |
| -0.960000000000085 | 1.257 | 1.497 | 1.772 |
| -0.955000000000085 | 1.253 | 1.492 | 1.765 |
| -0.950000000000085 | 1.249 | 1.486 | 1.757 |
| -0.945000000000085 | 1.246 | 1.481 | 1.75 |
| -0.940000000000085 | 1.242 | 1.475 | 1.742 |
| -0.935000000000085 | 1.238 | 1.47 | 1.735 |
| -0.930000000000085 | 1.234 | 1.465 | 1.728 |
| -0.925000000000085 | 1.23 | 1.459 | 1.72 |
| -0.920000000000085 | 1.227 | 1.454 | 1.713 |
| -0.915000000000085 | 1.223 | 1.449 | 1.706 |
| -0.910000000000085 | 1.219 | 1.443 | 1.699 |
| -0.905000000000085 | 1.215 | 1.438 | 1.692 |
| -0.900000000000085 | 1.212 | 1.433 | 1.685 |
| -0.895000000000085 | 1.208 | 1.428 | 1.678 |
| -0.890000000000085 | 1.204 | 1.423 | 1.671 |
| -0.885000000000085 | 1.201 | 1.418 | 1.664 |
| -0.880000000000085 | 1.197 | 1.413 | 1.657 |
| -0.875000000000085 | 1.194 | 1.408 | 1.65 |
| -0.870000000000085 | 1.19 | 1.403 | 1.643 |
| -0.865000000000085 | 1.187 | 1.398 | 1.637 |
| -0.860000000000085 | 1.183 | 1.393 | 1.63 |
| -0.855000000000085 | 1.18 | 1.388 | 1.623 |
| -0.850000000000085 | 1.176 | 1.384 | 1.617 |
| -0.845000000000085 | 1.173 | 1.379 | 1.61 |
| -0.840000000000085 | 1.17 | 1.374 | 1.604 |
| -0.835000000000085 | 1.166 | 1.369 | 1.598 |
| -0.830000000000085 | 1.163 | 1.365 | 1.591 |
| -0.825000000000085 | 1.16 | 1.36 | 1.585 |
| -0.820000000000085 | 1.156 | 1.355 | 1.579 |
| -0.815000000000085 | 1.153 | 1.351 | 1.572 |
| -0.810000000000085 | 1.15 | 1.346 | 1.566 |
| -0.805000000000085 | 1.147 | 1.342 | 1.56 |
| -0.800000000000085 | 1.144 | 1.337 | 1.554 |
| -0.795000000000085 | 1.14 | 1.333 | 1.548 |
| -0.790000000000085 | 1.137 | 1.329 | 1.542 |
| -0.785000000000085 | 1.134 | 1.324 | 1.536 |
| -0.780000000000085 | 1.131 | 1.32 | 1.53 |
| -0.775000000000085 | 1.128 | 1.316 | 1.525 |
| -0.770000000000085 | 1.125 | 1.311 | 1.519 |
| -0.765000000000085 | 1.122 | 1.307 | 1.513 |
| -0.760000000000085 | 1.119 | 1.303 | 1.507 |
| -0.755000000000085 | 1.116 | 1.299 | 1.502 |
| -0.750000000000085 | 1.113 | 1.295 | 1.496 |
| -0.745000000000085 | 1.11 | 1.291 | 1.491 |
| -0.740000000000085 | 1.107 | 1.287 | 1.485 |
| -0.735000000000085 | 1.104 | 1.282 | 1.48 |
| -0.730000000000085 | 1.101 | 1.278 | 1.474 |
| -0.725000000000085 | 1.098 | 1.275 | 1.469 |
| -0.720000000000085 | 1.096 | 1.271 | 1.463 |
| -0.715000000000085 | 1.093 | 1.267 | 1.458 |
| -0.710000000000085 | 1.09 | 1.263 | 1.453 |
| -0.705000000000085 | 1.087 | 1.259 | 1.448 |
| -0.700000000000085 | 1.085 | 1.255 | 1.443 |
| -0.695000000000085 | 1.082 | 1.251 | 1.437 |
| -0.690000000000085 | 1.079 | 1.248 | 1.432 |
| -0.685000000000085 | 1.077 | 1.244 | 1.427 |
| -0.680000000000085 | 1.074 | 1.24 | 1.422 |
| -0.675000000000085 | 1.071 | 1.237 | 1.417 |
| -0.670000000000085 | 1.069 | 1.233 | 1.413 |
| -0.665000000000085 | 1.066 | 1.229 | 1.408 |
| -0.660000000000085 | 1.063 | 1.226 | 1.403 |
| -0.655000000000085 | 1.061 | 1.222 | 1.398 |
| -0.650000000000085 | 1.058 | 1.219 | 1.393 |
| -0.645000000000085 | 1.056 | 1.215 | 1.389 |
| -0.640000000000085 | 1.053 | 1.212 | 1.384 |
| -0.635000000000085 | 1.051 | 1.208 | 1.379 |
| -0.630000000000085 | 1.049 | 1.205 | 1.375 |
| -0.625000000000085 | 1.046 | 1.202 | 1.37 |
| -0.620000000000085 | 1.044 | 1.198 | 1.366 |
| -0.615000000000085 | 1.041 | 1.195 | 1.361 |
| -0.610000000000085 | 1.039 | 1.192 | 1.357 |
| -0.605000000000085 | 1.037 | 1.189 | 1.353 |
| -0.600000000000085 | 1.034 | 1.185 | 1.348 |
| -0.595000000000085 | 1.032 | 1.182 | 1.344 |
| -0.590000000000085 | 1.03 | 1.179 | 1.34 |
| -0.585000000000085 | 1.028 | 1.176 | 1.336 |
| -0.580000000000085 | 1.025 | 1.173 | 1.332 |
| -0.575000000000085 | 1.023 | 1.17 | 1.327 |
| -0.570000000000085 | 1.021 | 1.167 | 1.323 |
| -0.565000000000085 | 1.019 | 1.164 | 1.319 |
| -0.560000000000085 | 1.017 | 1.161 | 1.315 |
| -0.555000000000085 | 1.015 | 1.158 | 1.311 |
| -0.550000000000085 | 1.013 | 1.155 | 1.308 |
| -0.545000000000085 | 1.01 | 1.152 | 1.304 |
| -0.540000000000085 | 1.008 | 1.149 | 1.3 |
| -0.535000000000085 | 1.006 | 1.147 | 1.296 |
| -0.530000000000085 | 1.004 | 1.144 | 1.292 |
| -0.525000000000085 | 1.002 | 1.141 | 1.289 |
| -0.520000000000085 | 1 | 1.138 | 1.285 |
| -0.515000000000085 | 0.998 | 1.136 | 1.281 |
| -0.510000000000085 | 0.996 | 1.133 | 1.278 |
| -0.505000000000085 | 0.995 | 1.13 | 1.274 |
| -0.500000000000085 | 0.993 | 1.128 | 1.271 |
| -0.495000000000085 | 0.991 | 1.125 | 1.267 |
| -0.490000000000085 | 0.989 | 1.122 | 1.264 |
| -0.485000000000085 | 0.987 | 1.12 | 1.26 |
| -0.480000000000085 | 0.985 | 1.117 | 1.257 |
| -0.475000000000085 | 0.984 | 1.115 | 1.254 |
| -0.470000000000085 | 0.982 | 1.112 | 1.25 |
| -0.465000000000085 | 0.98 | 1.11 | 1.247 |
| -0.460000000000085 | 0.978 | 1.108 | 1.244 |
| -0.455000000000085 | 0.977 | 1.105 | 1.241 |
| -0.450000000000085 | 0.975 | 1.103 | 1.238 |
| -0.445000000000085 | 0.973 | 1.101 | 1.234 |
| -0.440000000000085 | 0.971 | 1.098 | 1.231 |
| -0.435000000000085 | 0.97 | 1.096 | 1.228 |
| -0.430000000000085 | 0.968 | 1.094 | 1.225 |
| -0.425000000000085 | 0.967 | 1.092 | 1.222 |
| -0.420000000000085 | 0.965 | 1.09 | 1.219 |
| -0.415000000000085 | 0.964 | 1.087 | 1.217 |
| -0.410000000000085 | 0.962 | 1.085 | 1.214 |
| -0.405000000000085 | 0.96 | 1.083 | 1.211 |
| -0.400000000000085 | 0.959 | 1.081 | 1.208 |
| -0.395000000000085 | 0.957 | 1.079 | 1.205 |
| -0.390000000000085 | 0.956 | 1.077 | 1.203 |
| -0.385000000000085 | 0.955 | 1.075 | 1.2 |
| -0.380000000000085 | 0.953 | 1.073 | 1.198 |
| -0.375000000000085 | 0.952 | 1.071 | 1.195 |
| -0.370000000000085 | 0.95 | 1.069 | 1.192 |
| -0.365000000000085 | 0.949 | 1.067 | 1.19 |
| -0.360000000000085 | 0.948 | 1.066 | 1.187 |
| -0.355000000000085 | 0.946 | 1.064 | 1.185 |
| -0.350000000000085 | 0.945 | 1.062 | 1.183 |
| -0.345000000000085 | 0.944 | 1.06 | 1.18 |
| -0.340000000000085 | 0.942 | 1.058 | 1.178 |
| -0.335000000000085 | 0.941 | 1.057 | 1.176 |
| -0.330000000000085 | 0.94 | 1.055 | 1.173 |
| -0.325000000000085 | 0.939 | 1.053 | 1.171 |
| -0.320000000000085 | 0.938 | 1.052 | 1.169 |
| -0.315000000000085 | 0.936 | 1.05 | 1.167 |
| -0.310000000000085 | 0.935 | 1.048 | 1.165 |
| -0.305000000000085 | 0.934 | 1.047 | 1.162 |
| -0.300000000000085 | 0.933 | 1.045 | 1.16 |
| -0.295000000000085 | 0.932 | 1.044 | 1.158 |
| -0.290000000000085 | 0.931 | 1.042 | 1.156 |
| -0.285000000000085 | 0.93 | 1.041 | 1.154 |
| -0.280000000000085 | 0.929 | 1.039 | 1.153 |
| -0.275000000000085 | 0.928 | 1.038 | 1.151 |
| -0.270000000000085 | 0.927 | 1.037 | 1.149 |
| -0.265000000000085 | 0.926 | 1.035 | 1.147 |
| -0.260000000000085 | 0.925 | 1.034 | 1.145 |
| -0.255000000000085 | 0.924 | 1.033 | 1.144 |
| -0.250000000000085 | 0.923 | 1.031 | 1.142 |
| -0.245000000000085 | 0.922 | 1.03 | 1.14 |
| -0.240000000000085 | 0.921 | 1.029 | 1.139 |
| -0.235000000000085 | 0.92 | 1.028 | 1.137 |
| -0.230000000000085 | 0.919 | 1.027 | 1.135 |
| -0.225000000000085 | 0.919 | 1.025 | 1.134 |
| -0.220000000000085 | 0.918 | 1.024 | 1.132 |
| -0.215000000000085 | 0.917 | 1.023 | 1.131 |
| -0.210000000000085 | 0.916 | 1.022 | 1.129 |
| -0.205000000000085 | 0.915 | 1.021 | 1.128 |
| -0.200000000000085 | 0.915 | 1.02 | 1.127 |
| -0.195000000000085 | 0.914 | 1.019 | 1.125 |
| -0.190000000000085 | 0.913 | 1.018 | 1.124 |
| -0.185000000000085 | 0.913 | 1.017 | 1.123 |
| -0.180000000000085 | 0.912 | 1.016 | 1.122 |
| -0.175000000000085 | 0.911 | 1.015 | 1.12 |
| -0.170000000000085 | 0.911 | 1.014 | 1.119 |
| -0.165000000000085 | 0.91 | 1.014 | 1.118 |
| -0.160000000000085 | 0.909 | 1.013 | 1.117 |
| -0.155000000000084 | 0.909 | 1.012 | 1.116 |
| -0.150000000000084 | 0.908 | 1.011 | 1.115 |
| -0.145000000000084 | 0.908 | 1.011 | 1.114 |
| -0.140000000000084 | 0.907 | 1.01 | 1.113 |
| -0.135000000000084 | 0.907 | 1.009 | 1.112 |
| -0.130000000000084 | 0.906 | 1.008 | 1.111 |
| -0.125000000000084 | 0.906 | 1.008 | 1.11 |
| -0.120000000000084 | 0.905 | 1.007 | 1.11 |
| -0.115000000000084 | 0.905 | 1.007 | 1.109 |
| -0.110000000000084 | 0.904 | 1.006 | 1.108 |
| -0.105000000000084 | 0.904 | 1.006 | 1.107 |
| -0.100000000000084 | 0.904 | 1.005 | 1.107 |
| -0.0950000000000844 | 0.903 | 1.005 | 1.106 |
| -0.0900000000000844 | 0.903 | 1.004 | 1.105 |
| -0.0850000000000844 | 0.903 | 1.004 | 1.105 |
| -0.0800000000000844 | 0.902 | 1.003 | 1.104 |
| -0.0750000000000844 | 0.902 | 1.003 | 1.104 |
| -0.0700000000000844 | 0.902 | 1.002 | 1.103 |
| -0.0650000000000844 | 0.902 | 1.002 | 1.103 |
| -0.0600000000000844 | 0.901 | 1.002 | 1.102 |
| -0.0550000000000844 | 0.901 | 1.002 | 1.102 |
| -0.0500000000000844 | 0.901 | 1.001 | 1.102 |
| -0.0450000000000844 | 0.901 | 1.001 | 1.101 |
| -0.0400000000000844 | 0.901 | 1.001 | 1.101 |
| -0.0350000000000844 | 0.9 | 1.001 | 1.101 |
| -0.0300000000000844 | 0.9 | 1 | 1.101 |
| -0.0250000000000844 | 0.9 | 1 | 1.1 |
| -0.0200000000000844 | 0.9 | 1 | 1.1 |
| -0.0150000000000844 | 0.9 | 1 | 1.1 |
| -0.0100000000000844 | 0.9 | 1 | 1.1 |
| -0.00500000000008444 | 0.9 | 1 | 1.1 |
| -8.4444604087075e-14 | 0.9 | 1 | 1.1 |
| 0.00499999999991555 | 0.9 | 1 | 1.1 |
| 0.00999999999991555 | 0.9 | 1 | 1.1 |
| 0.0149999999999156 | 0.9 | 1 | 1.1 |
| 0.0199999999999156 | 0.9 | 1 | 1.1 |
| 0.0249999999999156 | 0.9 | 1 | 1.1 |
| 0.0299999999999156 | 0.9 | 1 | 1.101 |
| 0.0349999999999155 | 0.9 | 1.001 | 1.101 |
| 0.0399999999999155 | 0.901 | 1.001 | 1.101 |
| 0.0449999999999155 | 0.901 | 1.001 | 1.101 |
| 0.0499999999999155 | 0.901 | 1.001 | 1.102 |
| 0.0549999999999155 | 0.901 | 1.002 | 1.102 |
| 0.0599999999999155 | 0.901 | 1.002 | 1.102 |
| 0.0649999999999155 | 0.902 | 1.002 | 1.103 |
| 0.0699999999999155 | 0.902 | 1.002 | 1.103 |
| 0.0749999999999155 | 0.902 | 1.003 | 1.104 |
| 0.0799999999999155 | 0.902 | 1.003 | 1.104 |
| 0.0849999999999155 | 0.903 | 1.004 | 1.105 |
| 0.0899999999999155 | 0.903 | 1.004 | 1.105 |
| 0.0949999999999155 | 0.903 | 1.005 | 1.106 |
| 0.0999999999999155 | 0.904 | 1.005 | 1.107 |
| 0.104999999999916 | 0.904 | 1.006 | 1.107 |
| 0.109999999999916 | 0.904 | 1.006 | 1.108 |
| 0.114999999999916 | 0.905 | 1.007 | 1.109 |
| 0.119999999999916 | 0.905 | 1.007 | 1.11 |
| 0.124999999999916 | 0.906 | 1.008 | 1.11 |
| 0.129999999999916 | 0.906 | 1.008 | 1.111 |
| 0.134999999999916 | 0.907 | 1.009 | 1.112 |
| 0.139999999999916 | 0.907 | 1.01 | 1.113 |
| 0.144999999999916 | 0.908 | 1.011 | 1.114 |
| 0.149999999999916 | 0.908 | 1.011 | 1.115 |
| 0.154999999999916 | 0.909 | 1.012 | 1.116 |
| 0.159999999999916 | 0.909 | 1.013 | 1.117 |
| 0.164999999999916 | 0.91 | 1.014 | 1.118 |
| 0.169999999999916 | 0.911 | 1.014 | 1.119 |
| 0.174999999999916 | 0.911 | 1.015 | 1.12 |
| 0.179999999999916 | 0.912 | 1.016 | 1.122 |
| 0.184999999999916 | 0.913 | 1.017 | 1.123 |
| 0.189999999999916 | 0.913 | 1.018 | 1.124 |
| 0.194999999999916 | 0.914 | 1.019 | 1.125 |
| 0.199999999999916 | 0.915 | 1.02 | 1.127 |
| 0.204999999999916 | 0.915 | 1.021 | 1.128 |
| 0.209999999999916 | 0.916 | 1.022 | 1.129 |
| 0.214999999999916 | 0.917 | 1.023 | 1.131 |
| 0.219999999999916 | 0.918 | 1.024 | 1.132 |
| 0.224999999999916 | 0.919 | 1.025 | 1.134 |
| 0.229999999999916 | 0.919 | 1.027 | 1.135 |
| 0.234999999999916 | 0.92 | 1.028 | 1.137 |
| 0.239999999999916 | 0.921 | 1.029 | 1.139 |
| 0.244999999999916 | 0.922 | 1.03 | 1.14 |
| 0.249999999999916 | 0.923 | 1.031 | 1.142 |
| 0.254999999999916 | 0.924 | 1.033 | 1.144 |
| 0.259999999999916 | 0.925 | 1.034 | 1.145 |
| 0.264999999999916 | 0.926 | 1.035 | 1.147 |
| 0.269999999999916 | 0.927 | 1.037 | 1.149 |
| 0.274999999999916 | 0.928 | 1.038 | 1.151 |
| 0.279999999999916 | 0.929 | 1.039 | 1.153 |
| 0.284999999999916 | 0.93 | 1.041 | 1.154 |
| 0.289999999999916 | 0.931 | 1.042 | 1.156 |
| 0.294999999999916 | 0.932 | 1.044 | 1.158 |
| 0.299999999999916 | 0.933 | 1.045 | 1.16 |
| 0.304999999999916 | 0.934 | 1.047 | 1.162 |
| 0.309999999999916 | 0.935 | 1.048 | 1.165 |
| 0.314999999999916 | 0.936 | 1.05 | 1.167 |
| 0.319999999999916 | 0.938 | 1.052 | 1.169 |
| 0.324999999999916 | 0.939 | 1.053 | 1.171 |
| 0.329999999999916 | 0.94 | 1.055 | 1.173 |
| 0.334999999999916 | 0.941 | 1.057 | 1.176 |
| 0.339999999999916 | 0.942 | 1.058 | 1.178 |
| 0.344999999999916 | 0.944 | 1.06 | 1.18 |
| 0.349999999999916 | 0.945 | 1.062 | 1.183 |
| 0.354999999999916 | 0.946 | 1.064 | 1.185 |
| 0.359999999999916 | 0.948 | 1.066 | 1.187 |
| 0.364999999999916 | 0.949 | 1.067 | 1.19 |
| 0.369999999999916 | 0.95 | 1.069 | 1.192 |
| 0.374999999999916 | 0.952 | 1.071 | 1.195 |
| 0.379999999999916 | 0.953 | 1.073 | 1.198 |
| 0.384999999999916 | 0.955 | 1.075 | 1.2 |
| 0.389999999999916 | 0.956 | 1.077 | 1.203 |
| 0.394999999999916 | 0.957 | 1.079 | 1.205 |
| 0.399999999999916 | 0.959 | 1.081 | 1.208 |
| 0.404999999999916 | 0.96 | 1.083 | 1.211 |
| 0.409999999999916 | 0.962 | 1.085 | 1.214 |
| 0.414999999999916 | 0.964 | 1.087 | 1.217 |
| 0.419999999999916 | 0.965 | 1.09 | 1.219 |
| 0.424999999999916 | 0.967 | 1.092 | 1.222 |
| 0.429999999999916 | 0.968 | 1.094 | 1.225 |
| 0.434999999999916 | 0.97 | 1.096 | 1.228 |
| 0.439999999999916 | 0.971 | 1.098 | 1.231 |
| 0.444999999999916 | 0.973 | 1.101 | 1.234 |
| 0.449999999999916 | 0.975 | 1.103 | 1.238 |
| 0.454999999999916 | 0.977 | 1.105 | 1.241 |
| 0.459999999999916 | 0.978 | 1.108 | 1.244 |
| 0.464999999999916 | 0.98 | 1.11 | 1.247 |
| 0.469999999999916 | 0.982 | 1.112 | 1.25 |
| 0.474999999999916 | 0.984 | 1.115 | 1.254 |
| 0.479999999999916 | 0.985 | 1.117 | 1.257 |
| 0.484999999999916 | 0.987 | 1.12 | 1.26 |
| 0.489999999999916 | 0.989 | 1.122 | 1.264 |
| 0.494999999999916 | 0.991 | 1.125 | 1.267 |
| 0.499999999999916 | 0.993 | 1.128 | 1.271 |
| 0.504999999999916 | 0.995 | 1.13 | 1.274 |
| 0.509999999999916 | 0.996 | 1.133 | 1.278 |
| 0.514999999999916 | 0.998 | 1.136 | 1.281 |
| 0.519999999999916 | 1 | 1.138 | 1.285 |
| 0.524999999999916 | 1.002 | 1.141 | 1.289 |
| 0.529999999999916 | 1.004 | 1.144 | 1.292 |
| 0.534999999999916 | 1.006 | 1.147 | 1.296 |
| 0.539999999999916 | 1.008 | 1.149 | 1.3 |
| 0.544999999999916 | 1.01 | 1.152 | 1.304 |
| 0.549999999999916 | 1.013 | 1.155 | 1.308 |
| 0.554999999999916 | 1.015 | 1.158 | 1.311 |
| 0.559999999999916 | 1.017 | 1.161 | 1.315 |
| 0.564999999999916 | 1.019 | 1.164 | 1.319 |
| 0.569999999999916 | 1.021 | 1.167 | 1.323 |
| 0.574999999999916 | 1.023 | 1.17 | 1.327 |
| 0.579999999999916 | 1.025 | 1.173 | 1.332 |
| 0.584999999999916 | 1.028 | 1.176 | 1.336 |
| 0.589999999999916 | 1.03 | 1.179 | 1.34 |
| 0.594999999999916 | 1.032 | 1.182 | 1.344 |
| 0.599999999999916 | 1.034 | 1.185 | 1.348 |
| 0.604999999999916 | 1.037 | 1.189 | 1.353 |
| 0.609999999999916 | 1.039 | 1.192 | 1.357 |
| 0.614999999999916 | 1.041 | 1.195 | 1.361 |
| 0.619999999999916 | 1.044 | 1.198 | 1.366 |
| 0.624999999999916 | 1.046 | 1.202 | 1.37 |
| 0.629999999999916 | 1.049 | 1.205 | 1.375 |
| 0.634999999999916 | 1.051 | 1.208 | 1.379 |
| 0.639999999999916 | 1.053 | 1.212 | 1.384 |
| 0.644999999999916 | 1.056 | 1.215 | 1.389 |
| 0.649999999999916 | 1.058 | 1.219 | 1.393 |
| 0.654999999999916 | 1.061 | 1.222 | 1.398 |
| 0.659999999999916 | 1.063 | 1.226 | 1.403 |
| 0.664999999999916 | 1.066 | 1.229 | 1.408 |
| 0.669999999999916 | 1.069 | 1.233 | 1.413 |
| 0.674999999999916 | 1.071 | 1.237 | 1.417 |
| 0.679999999999916 | 1.074 | 1.24 | 1.422 |
| 0.684999999999916 | 1.077 | 1.244 | 1.427 |
| 0.689999999999916 | 1.079 | 1.248 | 1.432 |
| 0.694999999999916 | 1.082 | 1.251 | 1.437 |
| 0.699999999999916 | 1.085 | 1.255 | 1.443 |
| 0.704999999999916 | 1.087 | 1.259 | 1.448 |
| 0.709999999999916 | 1.09 | 1.263 | 1.453 |
| 0.714999999999916 | 1.093 | 1.267 | 1.458 |
| 0.719999999999916 | 1.096 | 1.271 | 1.463 |
| 0.724999999999916 | 1.098 | 1.275 | 1.469 |
| 0.729999999999916 | 1.101 | 1.278 | 1.474 |
| 0.734999999999916 | 1.104 | 1.282 | 1.48 |
| 0.739999999999916 | 1.107 | 1.287 | 1.485 |
| 0.744999999999916 | 1.11 | 1.291 | 1.491 |
| 0.749999999999916 | 1.113 | 1.295 | 1.496 |
| 0.754999999999916 | 1.116 | 1.299 | 1.502 |
| 0.759999999999916 | 1.119 | 1.303 | 1.507 |
| 0.764999999999916 | 1.122 | 1.307 | 1.513 |
| 0.769999999999916 | 1.125 | 1.311 | 1.519 |
| 0.774999999999916 | 1.128 | 1.316 | 1.525 |
| 0.779999999999916 | 1.131 | 1.32 | 1.53 |
| 0.784999999999916 | 1.134 | 1.324 | 1.536 |
| 0.789999999999916 | 1.137 | 1.329 | 1.542 |
| 0.794999999999916 | 1.14 | 1.333 | 1.548 |
| 0.799999999999916 | 1.144 | 1.337 | 1.554 |
| 0.804999999999916 | 1.147 | 1.342 | 1.56 |
| 0.809999999999916 | 1.15 | 1.346 | 1.566 |
| 0.814999999999916 | 1.153 | 1.351 | 1.572 |
| 0.819999999999916 | 1.156 | 1.355 | 1.579 |
| 0.824999999999916 | 1.16 | 1.36 | 1.585 |
| 0.829999999999916 | 1.163 | 1.365 | 1.591 |
| 0.834999999999916 | 1.166 | 1.369 | 1.598 |
| 0.839999999999916 | 1.17 | 1.374 | 1.604 |
| 0.844999999999916 | 1.173 | 1.379 | 1.61 |
| 0.849999999999916 | 1.176 | 1.384 | 1.617 |
| 0.854999999999916 | 1.18 | 1.388 | 1.623 |
| 0.859999999999916 | 1.183 | 1.393 | 1.63 |
| 0.864999999999916 | 1.187 | 1.398 | 1.637 |
| 0.869999999999916 | 1.19 | 1.403 | 1.643 |
| 0.874999999999916 | 1.194 | 1.408 | 1.65 |
| 0.879999999999916 | 1.197 | 1.413 | 1.657 |
| 0.884999999999916 | 1.201 | 1.418 | 1.664 |
| 0.889999999999916 | 1.204 | 1.423 | 1.671 |
| 0.894999999999916 | 1.208 | 1.428 | 1.678 |
| 0.899999999999916 | 1.212 | 1.433 | 1.685 |
| 0.904999999999916 | 1.215 | 1.438 | 1.692 |
| 0.909999999999916 | 1.219 | 1.443 | 1.699 |
| 0.914999999999916 | 1.223 | 1.449 | 1.706 |
| 0.919999999999916 | 1.227 | 1.454 | 1.713 |
| 0.924999999999916 | 1.23 | 1.459 | 1.72 |
| 0.929999999999916 | 1.234 | 1.465 | 1.728 |
| 0.934999999999916 | 1.238 | 1.47 | 1.735 |
| 0.939999999999916 | 1.242 | 1.475 | 1.742 |
| 0.944999999999916 | 1.246 | 1.481 | 1.75 |
| 0.949999999999916 | 1.249 | 1.486 | 1.757 |
| 0.954999999999916 | 1.253 | 1.492 | 1.765 |
| 0.959999999999916 | 1.257 | 1.497 | 1.772 |
| 0.964999999999916 | 1.261 | 1.503 | 1.78 |
| 0.969999999999916 | 1.265 | 1.509 | 1.788 |
| 0.974999999999916 | 1.269 | 1.514 | 1.796 |
| 0.979999999999916 | 1.273 | 1.52 | 1.803 |
| 0.984999999999916 | 1.277 | 1.526 | 1.811 |
| 0.989999999999916 | 1.282 | 1.531 | 1.819 |
| 0.994999999999916 | 1.286 | 1.537 | 1.827 |
| 0.999999999999916 | 1.29 | 1.543 | 1.835 |
| 1.004999999999916 | 1.294 | 1.549 | 1.843 |
| 1.009999999999916 | 1.298 | 1.555 | 1.852 |
| 1.014999999999916 | 1.302 | 1.561 | 1.86 |
| 1.019999999999916 | 1.307 | 1.567 | 1.868 |
| 1.024999999999916 | 1.311 | 1.573 | 1.876 |
| 1.029999999999916 | 1.315 | 1.579 | 1.885 |
| 1.034999999999916 | 1.32 | 1.585 | 1.893 |
| 1.039999999999915 | 1.324 | 1.591 | 1.902 |
| 1.044999999999915 | 1.328 | 1.598 | 1.91 |
| 1.049999999999915 | 1.333 | 1.604 | 1.919 |
| 1.054999999999915 | 1.337 | 1.61 | 1.928 |
| 1.059999999999915 | 1.342 | 1.616 | 1.936 |
| 1.064999999999915 | 1.346 | 1.623 | 1.945 |
| 1.069999999999915 | 1.351 | 1.629 | 1.954 |
| 1.074999999999915 | 1.355 | 1.636 | 1.963 |
| 1.079999999999915 | 1.36 | 1.642 | 1.972 |
| 1.084999999999914 | 1.364 | 1.649 | 1.981 |
| 1.089999999999914 | 1.369 | 1.655 | 1.99 |
| 1.094999999999914 | 1.374 | 1.662 | 1.999 |
| 1.099999999999914 | 1.378 | 1.669 | 2.008 |
| 1.104999999999914 | 1.383 | 1.675 | 2.018 |
| 1.109999999999914 | 1.388 | 1.682 | 2.027 |
| 1.114999999999914 | 1.392 | 1.689 | 2.036 |
| 1.119999999999914 | 1.397 | 1.696 | 2.046 |
| 1.124999999999914 | 1.402 | 1.702 | 2.055 |
| 1.129999999999914 | 1.407 | 1.709 | 2.065 |
| 1.134999999999913 | 1.412 | 1.716 | 2.075 |
| 1.139999999999913 | 1.417 | 1.723 | 2.084 |
| 1.144999999999913 | 1.422 | 1.73 | 2.094 |
| 1.149999999999913 | 1.427 | 1.737 | 2.104 |
| 1.154999999999913 | 1.432 | 1.745 | 2.114 |
| 1.159999999999913 | 1.437 | 1.752 | 2.124 |
| 1.164999999999913 | 1.442 | 1.759 | 2.134 |
| 1.169999999999913 | 1.447 | 1.766 | 2.144 |
| 1.174999999999913 | 1.452 | 1.773 | 2.154 |
| 1.179999999999912 | 1.457 | 1.781 | 2.164 |
| 1.184999999999912 | 1.462 | 1.788 | 2.175 |
| 1.189999999999912 | 1.467 | 1.796 | 2.185 |
| 1.194999999999912 | 1.473 | 1.803 | 2.195 |
| 1.199999999999912 | 1.478 | 1.811 | 2.206 |
| 1.204999999999912 | 1.483 | 1.818 | 2.216 |
| 1.209999999999912 | 1.489 | 1.826 | 2.227 |
| 1.214999999999912 | 1.494 | 1.834 | 2.238 |
| 1.219999999999912 | 1.499 | 1.841 | 2.248 |
| 1.224999999999911 | 1.505 | 1.849 | 2.259 |
| 1.229999999999911 | 1.51 | 1.857 | 2.27 |
| 1.234999999999911 | 1.516 | 1.865 | 2.281 |
| 1.239999999999911 | 1.521 | 1.872 | 2.292 |
| 1.244999999999911 | 1.527 | 1.88 | 2.303 |
| 1.249999999999911 | 1.532 | 1.888 | 2.314 |
| 1.254999999999911 | 1.538 | 1.896 | 2.326 |
| 1.259999999999911 | 1.543 | 1.905 | 2.337 |
| 1.264999999999911 | 1.549 | 1.913 | 2.348 |
| 1.269999999999911 | 1.555 | 1.921 | 2.36 |
| 1.27499999999991 | 1.56 | 1.929 | 2.371 |
| 1.27999999999991 | 1.566 | 1.937 | 2.383 |
| 1.28499999999991 | 1.572 | 1.946 | 2.394 |
| 1.28999999999991 | 1.578 | 1.954 | 2.406 |
| 1.29499999999991 | 1.584 | 1.962 | 2.418 |
| 1.29999999999991 | 1.59 | 1.971 | 2.43 |
| 1.30499999999991 | 1.595 | 1.979 | 2.442 |
| 1.30999999999991 | 1.601 | 1.988 | 2.454 |
| 1.31499999999991 | 1.607 | 1.997 | 2.466 |
| 1.319999999999909 | 1.613 | 2.005 | 2.478 |
| 1.324999999999909 | 1.619 | 2.014 | 2.49 |
| 1.329999999999909 | 1.626 | 2.023 | 2.503 |
| 1.334999999999909 | 1.632 | 2.032 | 2.515 |
| 1.339999999999909 | 1.638 | 2.04 | 2.528 |
| 1.344999999999909 | 1.644 | 2.049 | 2.54 |
| 1.349999999999909 | 1.65 | 2.058 | 2.553 |
| 1.354999999999909 | 1.656 | 2.067 | 2.566 |
| 1.359999999999909 | 1.663 | 2.076 | 2.578 |
| 1.364999999999908 | 1.669 | 2.086 | 2.591 |
| 1.369999999999908 | 1.675 | 2.095 | 2.604 |
| 1.374999999999908 | 1.682 | 2.104 | 2.617 |
| 1.379999999999908 | 1.688 | 2.113 | 2.63 |
| 1.384999999999908 | 1.695 | 2.123 | 2.643 |
| 1.389999999999908 | 1.701 | 2.132 | 2.657 |
| 1.394999999999908 | 1.708 | 2.141 | 2.67 |
| 1.399999999999908 | 1.714 | 2.151 | 2.683 |
| 1.404999999999908 | 1.721 | 2.16 | 2.697 |
| 1.409999999999908 | 1.727 | 2.17 | 2.711 |
| 1.414999999999907 | 1.734 | 2.18 | 2.724 |
| 1.419999999999907 | 1.741 | 2.189 | 2.738 |
| 1.424999999999907 | 1.747 | 2.199 | 2.752 |
| 1.429999999999907 | 1.754 | 2.209 | 2.766 |
| 1.434999999999907 | 1.761 | 2.219 | 2.78 |
| 1.439999999999907 | 1.768 | 2.229 | 2.794 |
| 1.444999999999907 | 1.775 | 2.239 | 2.808 |
| 1.449999999999907 | 1.781 | 2.249 | 2.822 |
| 1.454999999999907 | 1.788 | 2.259 | 2.837 |
| 1.459999999999906 | 1.795 | 2.269 | 2.851 |
| 1.464999999999906 | 1.802 | 2.279 | 2.865 |
| 1.469999999999906 | 1.809 | 2.29 | 2.88 |
| 1.474999999999906 | 1.817 | 2.3 | 2.895 |
| 1.479999999999906 | 1.824 | 2.31 | 2.909 |
| 1.484999999999906 | 1.831 | 2.321 | 2.924 |
| 1.489999999999906 | 1.838 | 2.331 | 2.939 |
| 1.494999999999906 | 1.845 | 2.342 | 2.954 |
| 1.499999999999906 | 1.852 | 2.352 | 2.969 |
| 1.504999999999906 | 1.86 | 2.363 | 2.985 |
| 1.509999999999905 | 1.867 | 2.374 | 3 |
| 1.514999999999905 | 1.875 | 2.385 | 3.015 |
| 1.519999999999905 | 1.882 | 2.395 | 3.031 |
| 1.524999999999905 | 1.889 | 2.406 | 3.046 |
| 1.529999999999905 | 1.897 | 2.417 | 3.062 |
| 1.534999999999905 | 1.904 | 2.428 | 3.078 |
| 1.539999999999905 | 1.912 | 2.439 | 3.094 |
| 1.544999999999905 | 1.92 | 2.451 | 3.11 |
| 1.549999999999905 | 1.927 | 2.462 | 3.126 |
| 1.554999999999904 | 1.935 | 2.473 | 3.142 |
| 1.559999999999904 | 1.943 | 2.484 | 3.158 |
| 1.564999999999904 | 1.95 | 2.496 | 3.174 |
| 1.569999999999904 | 1.958 | 2.507 | 3.191 |
| 1.574999999999904 | 1.966 | 2.519 | 3.207 |
| 1.579999999999904 | 1.974 | 2.53 | 3.224 |
| 1.584999999999904 | 1.982 | 2.542 | 3.241 |
| 1.589999999999904 | 1.99 | 2.554 | 3.258 |
| 1.594999999999904 | 1.998 | 2.566 | 3.274 |
| 1.599999999999903 | 2.006 | 2.577 | 3.291 |
| 1.604999999999903 | 2.014 | 2.589 | 3.309 |
| 1.609999999999903 | 2.022 | 2.601 | 3.326 |
| 1.614999999999903 | 2.03 | 2.613 | 3.343 |
| 1.619999999999903 | 2.039 | 2.625 | 3.361 |
| 1.624999999999903 | 2.047 | 2.638 | 3.378 |
| 1.629999999999903 | 2.055 | 2.65 | 3.396 |
| 1.634999999999903 | 2.063 | 2.662 | 3.413 |
| 1.639999999999903 | 2.072 | 2.675 | 3.431 |
| 1.644999999999902 | 2.08 | 2.687 | 3.449 |
| 1.649999999999902 | 2.089 | 2.7 | 3.467 |
| 1.654999999999902 | 2.097 | 2.712 | 3.485 |
| 1.659999999999902 | 2.106 | 2.725 | 3.504 |
| 1.664999999999902 | 2.114 | 2.737 | 3.522 |
| 1.669999999999902 | 2.123 | 2.75 | 3.54 |
| 1.674999999999902 | 2.132 | 2.763 | 3.559 |
| 1.679999999999902 | 2.14 | 2.776 | 3.578 |
| 1.684999999999902 | 2.149 | 2.789 | 3.596 |
| 1.689999999999901 | 2.158 | 2.802 | 3.615 |
| 1.694999999999901 | 2.167 | 2.815 | 3.634 |
| 1.699999999999901 | 2.176 | 2.828 | 3.653 |
| 1.704999999999901 | 2.185 | 2.842 | 3.673 |
| 1.709999999999901 | 2.194 | 2.855 | 3.692 |
| 1.714999999999901 | 2.203 | 2.868 | 3.711 |
| 1.719999999999901 | 2.212 | 2.882 | 3.731 |
| 1.724999999999901 | 2.221 | 2.895 | 3.751 |
| 1.729999999999901 | 2.23 | 2.909 | 3.77 |
| 1.734999999999901 | 2.239 | 2.923 | 3.79 |
| 1.7399999999999 | 2.248 | 2.936 | 3.81 |
| 1.7449999999999 | 2.258 | 2.95 | 3.83 |
| 1.7499999999999 | 2.267 | 2.964 | 3.851 |
| 1.7549999999999 | 2.276 | 2.978 | 3.871 |
| 1.7599999999999 | 2.286 | 2.992 | 3.891 |
| 1.7649999999999 | 2.295 | 3.006 | 3.912 |
| 1.7699999999999 | 2.305 | 3.021 | 3.933 |
| 1.7749999999999 | 2.314 | 3.035 | 3.954 |
| 1.7799999999999 | 2.324 | 3.049 | 3.974 |
| 1.784999999999899 | 2.334 | 3.064 | 3.996 |
| 1.789999999999899 | 2.343 | 3.078 | 4.017 |
| 1.794999999999899 | 2.353 | 3.093 | 4.038 |
| 1.799999999999899 | 2.363 | 3.107 | 4.059 |
| 1.804999999999899 | 2.373 | 3.122 | 4.081 |
| 1.809999999999899 | 2.383 | 3.137 | 4.103 |
| 1.814999999999899 | 2.393 | 3.152 | 4.124 |
| 1.819999999999899 | 2.403 | 3.167 | 4.146 |
| 1.824999999999899 | 2.413 | 3.182 | 4.168 |
| 1.829999999999899 | 2.423 | 3.197 | 4.191 |
| 1.834999999999898 | 2.433 | 3.212 | 4.213 |
| 1.839999999999898 | 2.443 | 3.228 | 4.235 |
| 1.844999999999898 | 2.453 | 3.243 | 4.258 |
| 1.849999999999898 | 2.464 | 3.259 | 4.281 |
| 1.854999999999898 | 2.474 | 3.274 | 4.303 |
| 1.859999999999898 | 2.484 | 3.29 | 4.326 |
| 1.864999999999898 | 2.495 | 3.305 | 4.349 |
| 1.869999999999898 | 2.505 | 3.321 | 4.373 |
| 1.874999999999898 | 2.516 | 3.337 | 4.396 |
| 1.879999999999897 | 2.527 | 3.353 | 4.419 |
| 1.884999999999897 | 2.537 | 3.369 | 4.443 |
| 1.889999999999897 | 2.548 | 3.385 | 4.467 |
| 1.894999999999897 | 2.559 | 3.401 | 4.491 |
| 1.899999999999897 | 2.569 | 3.418 | 4.515 |
| 1.904999999999897 | 2.58 | 3.434 | 4.539 |
| 1.909999999999897 | 2.591 | 3.451 | 4.563 |
| 1.914999999999897 | 2.602 | 3.467 | 4.588 |
| 1.919999999999897 | 2.613 | 3.484 | 4.612 |
| 1.924999999999897 | 2.624 | 3.501 | 4.637 |
| 1.929999999999896 | 2.635 | 3.517 | 4.662 |
| 1.934999999999896 | 2.647 | 3.534 | 4.687 |
| 1.939999999999896 | 2.658 | 3.551 | 4.712 |
| 1.944999999999896 | 2.669 | 3.568 | 4.737 |
| 1.949999999999896 | 2.68 | 3.585 | 4.763 |
| 1.954999999999896 | 2.692 | 3.603 | 4.788 |
| 1.959999999999896 | 2.703 | 3.62 | 4.814 |
| 1.964999999999896 | 2.715 | 3.638 | 4.84 |
| 1.969999999999896 | 2.726 | 3.655 | 4.866 |
| 1.974999999999895 | 2.738 | 3.673 | 4.892 |
| 1.979999999999895 | 2.75 | 3.69 | 4.918 |
| 1.984999999999895 | 2.761 | 3.708 | 4.944 |
| 1.989999999999895 | 2.773 | 3.726 | 4.971 |
| 1.994999999999895 | 2.785 | 3.744 | 4.998 |
| 1.999999999999895 | 2.797 | 3.762 | 5.025 |
| 2.004999999999895 | 2.809 | 3.78 | 5.052 |
| 2.009999999999895 | 2.821 | 3.799 | 5.079 |
| 2.014999999999895 | 2.833 | 3.817 | 5.106 |
| 2.019999999999895 | 2.845 | 3.835 | 5.134 |
| 2.024999999999895 | 2.857 | 3.854 | 5.161 |
| 2.029999999999895 | 2.869 | 3.873 | 5.189 |
| 2.034999999999894 | 2.882 | 3.891 | 5.217 |
| 2.039999999999894 | 2.894 | 3.91 | 5.245 |
| 2.044999999999894 | 2.906 | 3.929 | 5.274 |
| 2.049999999999894 | 2.919 | 3.948 | 5.302 |
| 2.054999999999894 | 2.931 | 3.967 | 5.331 |
| 2.059999999999894 | 2.944 | 3.987 | 5.359 |
| 2.064999999999894 | 2.957 | 4.006 | 5.388 |
| 2.069999999999894 | 2.969 | 4.026 | 5.417 |
| 2.074999999999894 | 2.982 | 4.045 | 5.447 |
| 2.079999999999893 | 2.995 | 4.065 | 5.476 |
| 2.084999999999893 | 3.008 | 4.084 | 5.506 |
| 2.089999999999893 | 3.021 | 4.104 | 5.536 |
| 2.094999999999893 | 3.034 | 4.124 | 5.565 |
| 2.099999999999893 | 3.047 | 4.144 | 5.596 |
| 2.104999999999893 | 3.06 | 4.164 | 5.626 |
| 2.109999999999893 | 3.073 | 4.185 | 5.656 |
| 2.114999999999893 | 3.086 | 4.205 | 5.687 |
| 2.119999999999893 | 3.1 | 4.226 | 5.718 |
| 2.124999999999893 | 3.113 | 4.246 | 5.749 |
| 2.129999999999892 | 3.126 | 4.267 | 5.78 |
| 2.134999999999892 | 3.14 | 4.288 | 5.811 |
| 2.139999999999892 | 3.153 | 4.309 | 5.842 |
| 2.144999999999892 | 3.167 | 4.33 | 5.874 |
| 2.149999999999892 | 3.181 | 4.351 | 5.906 |
| 2.154999999999892 | 3.195 | 4.372 | 5.938 |
| 2.159999999999892 | 3.208 | 4.393 | 5.97 |
| 2.164999999999892 | 3.222 | 4.415 | 6.002 |
| 2.169999999999892 | 3.236 | 4.436 | 6.035 |
| 2.174999999999891 | 3.25 | 4.458 | 6.068 |
| 2.179999999999891 | 3.264 | 4.48 | 6.101 |
| 2.184999999999891 | 3.279 | 4.502 | 6.134 |
| 2.189999999999891 | 3.293 | 4.524 | 6.167 |
| 2.194999999999891 | 3.307 | 4.546 | 6.2 |
| 2.199999999999891 | 3.321 | 4.568 | 6.234 |
| 2.204999999999891 | 3.336 | 4.59 | 6.268 |
| 2.209999999999891 | 3.35 | 4.613 | 6.302 |
| 2.214999999999891 | 3.365 | 4.635 | 6.336 |
| 2.21999999999989 | 3.379 | 4.658 | 6.371 |
| 2.22499999999989 | 3.394 | 4.681 | 6.405 |
| 2.22999999999989 | 3.409 | 4.704 | 6.44 |
| 2.23499999999989 | 3.424 | 4.727 | 6.475 |
| 2.23999999999989 | 3.439 | 4.75 | 6.51 |
| 2.24499999999989 | 3.454 | 4.773 | 6.546 |
| 2.24999999999989 | 3.469 | 4.797 | 6.581 |
| 2.25499999999989 | 3.484 | 4.82 | 6.617 |
| 2.25999999999989 | 3.499 | 4.844 | 6.653 |
| 2.26499999999989 | 3.514 | 4.867 | 6.689 |
| 2.269999999999889 | 3.53 | 4.891 | 6.726 |
| 2.274999999999889 | 3.545 | 4.915 | 6.762 |
| 2.279999999999889 | 3.56 | 4.939 | 6.799 |
| 2.284999999999889 | 3.576 | 4.964 | 6.836 |
| 2.289999999999889 | 3.592 | 4.988 | 6.873 |
| 2.294999999999889 | 3.607 | 5.013 | 6.911 |
| 2.299999999999889 | 3.623 | 5.037 | 6.948 |
| 2.304999999999889 | 3.639 | 5.062 | 6.986 |
| 2.309999999999889 | 3.655 | 5.087 | 7.024 |
| 2.314999999999888 | 3.671 | 5.112 | 7.062 |
| 2.319999999999888 | 3.687 | 5.137 | 7.101 |
| 2.324999999999888 | 3.703 | 5.162 | 7.14 |
| 2.329999999999888 | 3.719 | 5.188 | 7.178 |
| 2.334999999999888 | 3.735 | 5.213 | 7.218 |
| 2.339999999999888 | 3.752 | 5.239 | 7.257 |
| 2.344999999999888 | 3.768 | 5.265 | 7.296 |
| 2.349999999999888 | 3.785 | 5.29 | 7.336 |
| 2.354999999999888 | 3.801 | 5.317 | 7.376 |
| 2.359999999999887 | 3.818 | 5.343 | 7.417 |
| 2.364999999999887 | 3.835 | 5.369 | 7.457 |
| 2.369999999999887 | 3.851 | 5.395 | 7.498 |
| 2.374999999999887 | 3.868 | 5.422 | 7.539 |
| 2.379999999999887 | 3.885 | 5.449 | 7.58 |
| 2.384999999999887 | 3.902 | 5.476 | 7.621 |
| 2.389999999999887 | 3.919 | 5.503 | 7.663 |
| 2.394999999999887 | 3.937 | 5.53 | 7.704 |
| 2.399999999999887 | 3.954 | 5.557 | 7.747 |
| 2.404999999999887 | 3.971 | 5.584 | 7.789 |
| 2.409999999999886 | 3.989 | 5.612 | 7.831 |
| 2.414999999999886 | 4.006 | 5.64 | 7.874 |
| 2.419999999999886 | 4.024 | 5.667 | 7.917 |
| 2.424999999999886 | 4.042 | 5.695 | 7.96 |
| 2.429999999999886 | 4.059 | 5.723 | 8.004 |
| 2.434999999999886 | 4.077 | 5.752 | 8.048 |
| 2.439999999999886 | 4.095 | 5.78 | 8.092 |
| 2.444999999999886 | 4.113 | 5.809 | 8.136 |
| 2.449999999999886 | 4.131 | 5.837 | 8.18 |
| 2.454999999999885 | 4.149 | 5.866 | 8.225 |
| 2.459999999999885 | 4.168 | 5.895 | 8.27 |
| 2.464999999999885 | 4.186 | 5.924 | 8.315 |
| 2.469999999999885 | 4.204 | 5.954 | 8.361 |
| 2.474999999999885 | 4.223 | 5.983 | 8.406 |
| 2.479999999999885 | 4.242 | 6.013 | 8.452 |
| 2.484999999999885 | 4.26 | 6.042 | 8.498 |
| 2.489999999999885 | 4.279 | 6.072 | 8.545 |
| 2.494999999999885 | 4.298 | 6.102 | 8.592 |
| 2.499999999999884 | 4.317 | 6.132 | 8.639 |
| 2.504999999999884 | 4.336 | 6.163 | 8.686 |
| 2.509999999999884 | 4.355 | 6.193 | 8.733 |
| 2.514999999999884 | 4.374 | 6.224 | 8.781 |
| 2.519999999999884 | 4.394 | 6.255 | 8.829 |
| 2.524999999999884 | 4.413 | 6.285 | 8.878 |
| 2.529999999999884 | 4.432 | 6.317 | 8.926 |
| 2.534999999999884 | 4.452 | 6.348 | 8.975 |
| 2.539999999999884 | 4.472 | 6.379 | 9.024 |
| 2.544999999999884 | 4.491 | 6.411 | 9.073 |
| 2.549999999999883 | 4.511 | 6.443 | 9.123 |
| 2.554999999999883 | 4.531 | 6.474 | 9.173 |
| 2.559999999999883 | 4.551 | 6.507 | 9.223 |
| 2.564999999999883 | 4.571 | 6.539 | 9.274 |
| 2.569999999999883 | 4.592 | 6.571 | 9.325 |
| 2.574999999999883 | 4.612 | 6.604 | 9.376 |
| 2.579999999999883 | 4.632 | 6.636 | 9.427 |
| 2.584999999999883 | 4.653 | 6.669 | 9.479 |
| 2.589999999999883 | 4.673 | 6.702 | 9.531 |
| 2.594999999999882 | 4.694 | 6.736 | 9.583 |
| 2.599999999999882 | 4.715 | 6.769 | 9.635 |
| 2.604999999999882 | 4.736 | 6.803 | 9.688 |
| 2.609999999999882 | 4.757 | 6.836 | 9.741 |
| 2.614999999999882 | 4.778 | 6.87 | 9.795 |
| 2.619999999999882 | 4.799 | 6.904 | 9.848 |
| 2.624999999999882 | 4.82 | 6.939 | 9.902 |
| 2.629999999999882 | 4.842 | 6.973 | 9.957 |
| 2.634999999999882 | 4.863 | 7.008 | 10.011 |
| 2.639999999999881 | 4.885 | 7.042 | 10.066 |
| 2.644999999999881 | 4.906 | 7.077 | 10.121 |
| 2.649999999999881 | 4.928 | 7.112 | 10.177 |
| 2.654999999999881 | 4.95 | 7.148 | 10.232 |
| 2.659999999999881 | 4.972 | 7.183 | 10.289 |
| 2.664999999999881 | 4.994 | 7.219 | 10.345 |
| 2.669999999999881 | 5.016 | 7.255 | 10.402 |
| 2.674999999999881 | 5.038 | 7.291 | 10.459 |
| 2.679999999999881 | 5.061 | 7.327 | 10.516 |
| 2.68499999999988 | 5.083 | 7.363 | 10.574 |
| 2.68999999999988 | 5.106 | 7.4 | 10.632 |
| 2.69499999999988 | 5.128 | 7.437 | 10.69 |
| 2.69999999999988 | 5.151 | 7.473 | 10.749 |
| 2.70499999999988 | 5.174 | 7.511 | 10.808 |
| 2.70999999999988 | 5.197 | 7.548 | 10.867 |
| 2.71499999999988 | 5.22 | 7.585 | 10.927 |
| 2.71999999999988 | 5.243 | 7.623 | 10.987 |
| 2.72499999999988 | 5.267 | 7.661 | 11.047 |
| 2.72999999999988 | 5.29 | 7.699 | 11.108 |
| 2.734999999999879 | 5.313 | 7.737 | 11.168 |
| 2.739999999999879 | 5.337 | 7.776 | 11.23 |
| 2.744999999999879 | 5.361 | 7.814 | 11.291 |
| 2.749999999999879 | 5.385 | 7.853 | 11.353 |
| 2.754999999999879 | 5.409 | 7.892 | 11.416 |
| 2.759999999999879 | 5.433 | 7.932 | 11.478 |
| 2.764999999999879 | 5.457 | 7.971 | 11.541 |
| 2.769999999999879 | 5.481 | 8.011 | 11.605 |
| 2.774999999999879 | 5.505 | 8.05 | 11.668 |
| 2.779999999999878 | 5.53 | 8.091 | 11.733 |
| 2.784999999999878 | 5.555 | 8.131 | 11.797 |
| 2.789999999999878 | 5.579 | 8.171 | 11.862 |
| 2.794999999999878 | 5.604 | 8.212 | 11.927 |
| 2.799999999999878 | 5.629 | 8.253 | 11.992 |
| 2.804999999999878 | 5.654 | 8.294 | 12.058 |
| 2.809999999999878 | 5.679 | 8.335 | 12.124 |
| 2.814999999999878 | 5.705 | 8.377 | 12.191 |
| 2.819999999999878 | 5.73 | 8.418 | 12.258 |
| 2.824999999999878 | 5.756 | 8.46 | 12.325 |
| 2.829999999999877 | 5.781 | 8.502 | 12.393 |
| 2.834999999999877 | 5.807 | 8.545 | 12.461 |
| 2.839999999999877 | 5.833 | 8.587 | 12.53 |
| 2.844999999999877 | 5.859 | 8.63 | 12.598 |
| 2.849999999999877 | 5.885 | 8.673 | 12.668 |
| 2.854999999999877 | 5.911 | 8.716 | 12.737 |
| 2.859999999999877 | 5.937 | 8.759 | 12.807 |
| 2.864999999999877 | 5.964 | 8.803 | 12.878 |
| 2.869999999999877 | 5.991 | 8.847 | 12.948 |
| 2.874999999999876 | 6.017 | 8.891 | 13.02 |
| 2.879999999999876 | 6.044 | 8.935 | 13.091 |
| 2.884999999999876 | 6.071 | 8.98 | 13.163 |
| 2.889999999999876 | 6.098 | 9.024 | 13.235 |
| 2.894999999999876 | 6.125 | 9.069 | 13.308 |
| 2.899999999999876 | 6.153 | 9.115 | 13.381 |
| 2.904999999999876 | 6.18 | 9.16 | 13.455 |
| 2.909999999999876 | 6.208 | 9.206 | 13.529 |
| 2.914999999999876 | 6.235 | 9.252 | 13.603 |
| 2.919999999999876 | 6.263 | 9.298 | 13.678 |
| 2.924999999999875 | 6.291 | 9.344 | 13.753 |
| 2.929999999999875 | 6.319 | 9.391 | 13.829 |
| 2.934999999999875 | 6.347 | 9.437 | 13.905 |
| 2.939999999999875 | 6.376 | 9.484 | 13.981 |
| 2.944999999999875 | 6.404 | 9.532 | 14.058 |
| 2.949999999999875 | 6.433 | 9.579 | 14.135 |
| 2.954999999999875 | 6.462 | 9.627 | 14.213 |
| 2.959999999999875 | 6.49 | 9.675 | 14.291 |
| 2.964999999999875 | 6.519 | 9.723 | 14.37 |
| 2.969999999999874 | 6.549 | 9.772 | 14.449 |
| 2.974999999999874 | 6.578 | 9.82 | 14.528 |
| 2.979999999999874 | 6.607 | 9.869 | 14.608 |
| 2.984999999999874 | 6.637 | 9.919 | 14.689 |
| 2.989999999999874 | 6.666 | 9.968 | 14.769 |
| 2.994999999999874 | 6.696 | 10.018 | 14.851 |
| 2.999999999999874 | 6.726 | 10.068 | 14.932 |
| 3.004999999999874 | 6.756 | 10.118 | 15.014 |
| 3.009999999999874 | 6.786 | 10.168 | 15.097 |
| 3.014999999999874 | 6.817 | 10.219 | 15.18 |
| 3.019999999999873 | 6.847 | 10.27 | 15.263 |
| 3.024999999999873 | 6.878 | 10.321 | 15.347 |
| 3.029999999999873 | 6.909 | 10.373 | 15.432 |
| 3.034999999999873 | 6.939 | 10.425 | 15.517 |
| 3.039999999999873 | 6.97 | 10.477 | 15.602 |
| 3.044999999999873 | 7.002 | 10.529 | 15.688 |
| 3.049999999999873 | 7.033 | 10.581 | 15.774 |
| 3.054999999999873 | 7.064 | 10.634 | 15.861 |
| 3.059999999999873 | 7.096 | 10.687 | 15.948 |
| 3.064999999999872 | 7.128 | 10.741 | 16.036 |
| 3.069999999999872 | 7.16 | 10.794 | 16.124 |
| 3.074999999999872 | 7.192 | 10.848 | 16.213 |
| 3.079999999999872 | 7.224 | 10.902 | 16.302 |
| 3.084999999999872 | 7.256 | 10.957 | 16.392 |
| 3.089999999999872 | 7.289 | 11.011 | 16.482 |
| 3.094999999999872 | 7.321 | 11.066 | 16.573 |
| 3.099999999999872 | 7.354 | 11.122 | 16.664 |
| 3.104999999999872 | 7.387 | 11.177 | 16.756 |
| 3.109999999999872 | 7.42 | 11.233 | 16.848 |
| 3.114999999999871 | 7.453 | 11.289 | 16.941 |
| 3.119999999999871 | 7.487 | 11.345 | 17.034 |
| 3.124999999999871 | 7.52 | 11.402 | 17.128 |
| 3.129999999999871 | 7.554 | 11.459 | 17.222 |
| 3.134999999999871 | 7.588 | 11.516 | 17.317 |
| 3.139999999999871 | 7.622 | 11.574 | 17.412 |
| 3.144999999999871 | 7.656 | 11.631 | 17.508 |
| 3.149999999999871 | 7.69 | 11.689 | 17.604 |
| 3.154999999999871 | 7.725 | 11.748 | 17.701 |
| 3.15999999999987 | 7.759 | 11.807 | 17.799 |
| 3.16499999999987 | 7.794 | 11.865 | 17.897 |
| 3.16999999999987 | 7.829 | 11.925 | 17.995 |
| 3.17499999999987 | 7.864 | 11.984 | 18.094 |
| 3.17999999999987 | 7.899 | 12.044 | 18.194 |
| 3.18499999999987 | 7.935 | 12.104 | 18.294 |
| 3.18999999999987 | 7.97 | 12.165 | 18.395 |
| 3.19499999999987 | 8.006 | 12.226 | 18.496 |
| 3.19999999999987 | 8.042 | 12.287 | 18.598 |
| 3.204999999999869 | 8.078 | 12.348 | 18.7 |
| 3.209999999999869 | 8.114 | 12.41 | 18.803 |
| 3.214999999999869 | 8.15 | 12.472 | 18.907 |
| 3.219999999999869 | 8.187 | 12.534 | 19.011 |
| 3.224999999999869 | 8.224 | 12.597 | 19.115 |
| 3.229999999999869 | 8.26 | 12.66 | 19.221 |
| 3.234999999999869 | 8.297 | 12.723 | 19.326 |
| 3.239999999999869 | 8.335 | 12.786 | 19.433 |
| 3.244999999999869 | 8.372 | 12.85 | 19.54 |
| 3.249999999999869 | 8.41 | 12.915 | 19.647 |
| 3.254999999999868 | 8.447 | 12.979 | 19.756 |
| 3.259999999999868 | 8.485 | 13.044 | 19.864 |
| 3.264999999999868 | 8.523 | 13.109 | 19.974 |
| 3.269999999999868 | 8.561 | 13.175 | 20.084 |
| 3.274999999999868 | 8.6 | 13.241 | 20.194 |
| 3.279999999999868 | 8.638 | 13.307 | 20.306 |
| 3.284999999999868 | 8.677 | 13.373 | 20.417 |
| 3.289999999999868 | 8.716 | 13.44 | 20.53 |
| 3.294999999999868 | 8.755 | 13.507 | 20.643 |
| 3.299999999999867 | 8.794 | 13.575 | 20.757 |
| 3.304999999999867 | 8.834 | 13.643 | 20.871 |
| 3.309999999999867 | 8.874 | 13.711 | 20.986 |
| 3.314999999999867 | 8.913 | 13.779 | 21.101 |
| 3.319999999999867 | 8.953 | 13.848 | 21.218 |
| 3.324999999999867 | 8.994 | 13.917 | 21.335 |
| 3.329999999999867 | 9.034 | 13.987 | 21.452 |
| 3.334999999999867 | 9.074 | 14.057 | 21.57 |
| 3.339999999999867 | 9.115 | 14.127 | 21.689 |
| 3.344999999999866 | 9.156 | 14.198 | 21.808 |
| 3.349999999999866 | 9.197 | 14.269 | 21.929 |
| 3.354999999999866 | 9.238 | 14.34 | 22.049 |
| 3.359999999999866 | 9.28 | 14.412 | 22.171 |
| 3.364999999999866 | 9.322 | 14.484 | 22.293 |
| 3.369999999999866 | 9.363 | 14.556 | 22.416 |
| 3.374999999999866 | 9.405 | 14.629 | 22.539 |
| 3.379999999999866 | 9.448 | 14.702 | 22.663 |
| 3.384999999999866 | 9.49 | 14.776 | 22.788 |
| 3.389999999999866 | 9.533 | 14.85 | 22.914 |
| 3.394999999999865 | 9.576 | 14.924 | 23.04 |
| 3.399999999999865 | 9.619 | 14.999 | 23.167 |
| 3.404999999999865 | 9.662 | 15.074 | 23.295 |
| 3.409999999999865 | 9.705 | 15.149 | 23.423 |
| 3.414999999999865 | 9.749 | 15.225 | 23.552 |
| 3.419999999999865 | 9.792 | 15.301 | 23.682 |
| 3.424999999999865 | 9.836 | 15.378 | 23.812 |
| 3.429999999999865 | 9.881 | 15.455 | 23.943 |
| 3.434999999999865 | 9.925 | 15.532 | 24.075 |
| 3.439999999999864 | 9.97 | 15.61 | 24.208 |
| 3.444999999999864 | 10.014 | 15.688 | 24.341 |
| 3.449999999999864 | 10.059 | 15.766 | 24.475 |
| 3.454999999999864 | 10.105 | 15.845 | 24.61 |
| 3.459999999999864 | 10.15 | 15.924 | 24.746 |
| 3.464999999999864 | 10.195 | 16.004 | 24.882 |
| 3.469999999999864 | 10.241 | 16.084 | 25.019 |
| 3.474999999999864 | 10.287 | 16.164 | 25.157 |
| 3.479999999999864 | 10.334 | 16.245 | 25.296 |
| 3.484999999999864 | 10.38 | 16.327 | 25.435 |
| 3.489999999999863 | 10.427 | 16.408 | 25.575 |
| 3.494999999999863 | 10.473 | 16.49 | 25.716 |
| 3.499999999999863 | 10.521 | 16.573 | 25.858 |
| 3.504999999999863 | 10.568 | 16.656 | 26 |
| 3.509999999999863 | 10.615 | 16.739 | 26.144 |
| 3.514999999999863 | 10.663 | 16.823 | 26.288 |
| 3.519999999999863 | 10.711 | 16.907 | 26.433 |
| 3.524999999999863 | 10.759 | 16.992 | 26.578 |
| 3.529999999999863 | 10.807 | 17.077 | 26.725 |
| 3.534999999999862 | 10.856 | 17.162 | 26.872 |
| 3.539999999999862 | 10.905 | 17.248 | 27.02 |
| 3.544999999999862 | 10.954 | 17.334 | 27.169 |
| 3.549999999999862 | 11.003 | 17.421 | 27.319 |
| 3.554999999999862 | 11.052 | 17.508 | 27.469 |
| 3.559999999999862 | 11.102 | 17.596 | 27.621 |
| 3.564999999999862 | 11.152 | 17.684 | 27.773 |
| 3.569999999999862 | 11.202 | 17.772 | 27.926 |
| 3.574999999999862 | 11.253 | 17.861 | 28.08 |
| 3.579999999999862 | 11.303 | 17.951 | 28.234 |
| 3.584999999999861 | 11.354 | 18.041 | 28.39 |
| 3.589999999999861 | 11.405 | 18.131 | 28.547 |
| 3.594999999999861 | 11.456 | 18.222 | 28.704 |
| 3.599999999999861 | 11.508 | 18.313 | 28.862 |
| 3.604999999999861 | 11.56 | 18.404 | 29.021 |
| 3.609999999999861 | 11.612 | 18.497 | 29.181 |
| 3.614999999999861 | 11.664 | 18.589 | 29.342 |
| 3.619999999999861 | 11.716 | 18.682 | 29.504 |
| 3.62499999999986 | 11.769 | 18.776 | 29.666 |
| 3.62999999999986 | 11.822 | 18.87 | 29.83 |
| 3.63499999999986 | 11.875 | 18.964 | 29.994 |
| 3.63999999999986 | 11.928 | 19.059 | 30.159 |
| 3.64499999999986 | 11.982 | 19.154 | 30.326 |
| 3.64999999999986 | 12.036 | 19.25 | 30.493 |
| 3.65499999999986 | 12.09 | 19.347 | 30.661 |
| 3.65999999999986 | 12.144 | 19.444 | 30.83 |
| 3.66499999999986 | 12.199 | 19.541 | 31 |
| 3.669999999999859 | 12.254 | 19.639 | 31.171 |
| 3.674999999999859 | 12.309 | 19.737 | 31.342 |
| 3.679999999999859 | 12.364 | 19.836 | 31.515 |
| 3.684999999999859 | 12.42 | 19.935 | 31.689 |
| 3.689999999999859 | 12.476 | 20.035 | 31.863 |
| 3.694999999999859 | 12.532 | 20.135 | 32.039 |
| 3.699999999999859 | 12.588 | 20.236 | 32.216 |
| 3.704999999999859 | 12.645 | 20.337 | 32.393 |
| 3.709999999999859 | 12.702 | 20.439 | 32.572 |
| 3.714999999999859 | 12.759 | 20.541 | 32.751 |
| 3.719999999999858 | 12.816 | 20.644 | 32.932 |
| 3.724999999999858 | 12.874 | 20.748 | 33.113 |
| 3.729999999999858 | 12.932 | 20.852 | 33.296 |
| 3.734999999999858 | 12.99 | 20.956 | 33.479 |
| 3.739999999999858 | 13.049 | 21.061 | 33.664 |
| 3.744999999999858 | 13.107 | 21.166 | 33.85 |
| 3.749999999999858 | 13.166 | 21.272 | 34.036 |
| 3.754999999999858 | 13.226 | 21.379 | 34.224 |
| 3.759999999999858 | 13.285 | 21.486 | 34.412 |
| 3.764999999999857 | 13.345 | 21.593 | 34.602 |
| 3.769999999999857 | 13.405 | 21.702 | 34.793 |
| 3.774999999999857 | 13.465 | 21.81 | 34.985 |
| 3.779999999999857 | 13.526 | 21.919 | 35.178 |
| 3.784999999999857 | 13.587 | 22.029 | 35.371 |
| 3.789999999999857 | 13.648 | 22.139 | 35.566 |
| 3.794999999999857 | 13.709 | 22.25 | 35.762 |
| 3.799999999999857 | 13.771 | 22.362 | 35.96 |
| 3.804999999999857 | 13.833 | 22.474 | 36.158 |
| 3.809999999999857 | 13.895 | 22.586 | 36.357 |
| 3.814999999999856 | 13.958 | 22.699 | 36.558 |
| 3.819999999999856 | 14.021 | 22.813 | 36.759 |
| 3.824999999999856 | 14.084 | 22.927 | 36.962 |
| 3.829999999999856 | 14.147 | 23.042 | 37.166 |
| 3.834999999999856 | 14.211 | 23.158 | 37.37 |
| 3.839999999999856 | 14.275 | 23.273 | 37.576 |
| 3.844999999999856 | 14.339 | 23.39 | 37.784 |
| 3.849999999999856 | 14.403 | 23.507 | 37.992 |
| 3.854999999999856 | 14.468 | 23.625 | 38.201 |
| 3.859999999999855 | 14.533 | 23.743 | 38.412 |
| 3.864999999999855 | 14.599 | 23.862 | 38.624 |
| 3.869999999999855 | 14.665 | 23.982 | 38.837 |
| 3.874999999999855 | 14.731 | 24.102 | 39.051 |
| 3.879999999999855 | 14.797 | 24.222 | 39.266 |
| 3.884999999999855 | 14.864 | 24.344 | 39.482 |
| 3.889999999999855 | 14.93 | 24.466 | 39.7 |
| 3.894999999999855 | 14.998 | 24.588 | 39.919 |
| 3.899999999999855 | 15.065 | 24.711 | 40.139 |
| 3.904999999999855 | 15.133 | 24.835 | 40.36 |
| 3.909999999999854 | 15.201 | 24.959 | 40.583 |
| 3.914999999999854 | 15.27 | 25.085 | 40.807 |
| 3.919999999999854 | 15.338 | 25.21 | 41.032 |
| 3.924999999999854 | 15.407 | 25.336 | 41.258 |
| 3.929999999999854 | 15.477 | 25.463 | 41.485 |
| 3.934999999999854 | 15.546 | 25.591 | 41.714 |
| 3.939999999999854 | 15.616 | 25.719 | 41.944 |
| 3.944999999999854 | 15.687 | 25.848 | 42.175 |
| 3.949999999999854 | 15.757 | 25.977 | 42.408 |
| 3.954999999999853 | 15.828 | 26.107 | 42.642 |
| 3.959999999999853 | 15.9 | 26.238 | 42.877 |
| 3.964999999999853 | 15.971 | 26.37 | 43.113 |
| 3.969999999999853 | 16.043 | 26.502 | 43.351 |
| 3.974999999999853 | 16.115 | 26.634 | 43.59 |
| 3.979999999999853 | 16.188 | 26.768 | 43.83 |
| 3.984999999999853 | 16.261 | 26.902 | 44.072 |
| 3.989999999999853 | 16.334 | 27.037 | 44.315 |
| 3.994999999999853 | 16.408 | 27.172 | 44.559 |
| 3.999999999999853 | 16.482 | 27.308 | 44.805 |
| 4.004999999999852 | 16.556 | 27.445 | 45.052 |
| 4.009999999999852 | 16.63 | 27.583 | 45.3 |
| 4.014999999999852 | 16.705 | 27.721 | 45.55 |
| 4.019999999999852 | 16.78 | 27.86 | 45.801 |
| 4.024999999999852 | 16.856 | 27.999 | 46.054 |
| 4.029999999999852 | 16.932 | 28.139 | 46.308 |
| 4.034999999999852 | 17.008 | 28.28 | 46.563 |
| 4.039999999999851 | 17.085 | 28.422 | 46.82 |
| 4.044999999999852 | 17.162 | 28.564 | 47.078 |
| 4.049999999999851 | 17.239 | 28.707 | 47.337 |
| 4.054999999999851 | 17.317 | 28.851 | 47.598 |
| 4.059999999999851 | 17.395 | 28.996 | 47.861 |
| 4.064999999999851 | 17.473 | 29.141 | 48.125 |
| 4.069999999999851 | 17.552 | 29.287 | 48.39 |
| 4.074999999999851 | 17.631 | 29.434 | 48.657 |
| 4.07999999999985 | 17.71 | 29.581 | 48.925 |
| 4.084999999999851 | 17.79 | 29.729 | 49.195 |
| 4.08999999999985 | 17.87 | 29.878 | 49.466 |
| 4.094999999999851 | 17.951 | 30.028 | 49.739 |
| 4.09999999999985 | 18.031 | 30.178 | 50.013 |
| 4.10499999999985 | 18.113 | 30.33 | 50.289 |
| 4.10999999999985 | 18.194 | 30.482 | 50.566 |
| 4.11499999999985 | 18.276 | 30.634 | 50.845 |
| 4.11999999999985 | 18.359 | 30.788 | 51.125 |
| 4.12499999999985 | 18.441 | 30.942 | 51.407 |
| 4.12999999999985 | 18.524 | 31.097 | 51.691 |
| 4.13499999999985 | 18.608 | 31.253 | 51.976 |
| 4.13999999999985 | 18.692 | 31.409 | 52.262 |
| 4.144999999999849 | 18.776 | 31.567 | 52.55 |
| 4.14999999999985 | 18.86 | 31.725 | 52.84 |
| 4.154999999999849 | 18.945 | 31.884 | 53.132 |
| 4.15999999999985 | 19.031 | 32.044 | 53.424 |
| 4.164999999999849 | 19.116 | 32.204 | 53.719 |
| 4.169999999999849 | 19.203 | 32.365 | 54.015 |
| 4.174999999999849 | 19.289 | 32.528 | 54.313 |
| 4.179999999999848 | 19.376 | 32.691 | 54.613 |
| 4.184999999999849 | 19.463 | 32.854 | 54.914 |
| 4.189999999999848 | 19.551 | 33.019 | 55.217 |
| 4.194999999999848 | 19.639 | 33.184 | 55.521 |
| 4.199999999999848 | 19.727 | 33.351 | 55.827 |
| 4.204999999999848 | 19.816 | 33.518 | 56.135 |
| 4.209999999999848 | 19.906 | 33.686 | 56.445 |
| 4.214999999999848 | 19.995 | 33.854 | 56.756 |
| 4.219999999999847 | 20.085 | 34.024 | 57.069 |
| 4.224999999999848 | 20.176 | 34.195 | 57.383 |
| 4.229999999999847 | 20.267 | 34.366 | 57.7 |
| 4.234999999999847 | 20.358 | 34.538 | 58.018 |
| 4.239999999999847 | 20.45 | 34.711 | 58.338 |
| 4.244999999999847 | 20.542 | 34.885 | 58.66 |
| 4.249999999999847 | 20.635 | 35.06 | 58.983 |
| 4.254999999999847 | 20.728 | 35.236 | 59.308 |
| 4.259999999999846 | 20.821 | 35.412 | 59.635 |
| 4.264999999999847 | 20.915 | 35.589 | 59.964 |
| 4.269999999999846 | 21.009 | 35.768 | 60.295 |
| 4.274999999999846 | 21.104 | 35.947 | 60.627 |
| 4.279999999999846 | 21.199 | 36.127 | 60.962 |
| 4.284999999999846 | 21.294 | 36.308 | 61.298 |
| 4.289999999999846 | 21.39 | 36.49 | 61.636 |
| 4.294999999999846 | 21.487 | 36.673 | 61.976 |
| 4.299999999999846 | 21.583 | 36.857 | 62.317 |
| 4.304999999999846 | 21.681 | 37.041 | 62.661 |
| 4.309999999999845 | 21.778 | 37.227 | 63.007 |
| 4.314999999999846 | 21.877 | 37.413 | 63.354 |
| 4.319999999999845 | 21.975 | 37.601 | 63.703 |
| 4.324999999999846 | 22.074 | 37.789 | 64.055 |
| 4.329999999999845 | 22.174 | 37.979 | 64.408 |
| 4.334999999999845 | 22.274 | 38.169 | 64.763 |
| 4.339999999999845 | 22.374 | 38.36 | 65.12 |
| 4.344999999999845 | 22.475 | 38.553 | 65.479 |
| 4.349999999999845 | 22.576 | 38.746 | 65.84 |
| 4.354999999999845 | 22.678 | 38.94 | 66.203 |
| 4.359999999999844 | 22.78 | 39.135 | 66.568 |
| 4.364999999999845 | 22.883 | 39.331 | 66.936 |
| 4.369999999999844 | 22.986 | 39.528 | 67.305 |
| 4.374999999999844 | 23.089 | 39.726 | 67.676 |
| 4.379999999999844 | 23.193 | 39.925 | 68.049 |
| 4.384999999999844 | 23.298 | 40.125 | 68.424 |
| 4.389999999999844 | 23.403 | 40.326 | 68.802 |
| 4.394999999999844 | 23.508 | 40.528 | 69.181 |
| 4.399999999999844 | 23.614 | 40.732 | 69.562 |
| 4.404999999999844 | 23.721 | 40.936 | 69.946 |
| 4.409999999999843 | 23.828 | 41.141 | 70.332 |
| 4.414999999999844 | 23.935 | 41.347 | 70.72 |
| 4.419999999999843 | 24.043 | 41.554 | 71.11 |
| 4.424999999999843 | 24.151 | 41.762 | 71.502 |
| 4.429999999999843 | 24.26 | 41.972 | 71.896 |
| 4.434999999999843 | 24.37 | 42.182 | 72.293 |
| 4.439999999999843 | 24.479 | 42.393 | 72.691 |
| 4.444999999999843 | 24.59 | 42.606 | 73.092 |
| 4.449999999999842 | 24.701 | 42.819 | 73.495 |
| 4.454999999999843 | 24.812 | 43.034 | 73.9 |
| 4.459999999999842 | 24.924 | 43.25 | 74.308 |
| 4.464999999999843 | 25.036 | 43.466 | 74.718 |
| 4.469999999999842 | 25.149 | 43.684 | 75.13 |
| 4.474999999999842 | 25.262 | 43.903 | 75.544 |
| 4.479999999999842 | 25.376 | 44.123 | 75.961 |
| 4.484999999999842 | 25.49 | 44.344 | 76.38 |
| 4.489999999999842 | 25.605 | 44.566 | 76.801 |
| 4.494999999999842 | 25.721 | 44.79 | 77.224 |
| 4.499999999999841 | 25.837 | 45.014 | 77.65 |
| 4.504999999999842 | 25.953 | 45.24 | 78.078 |
| 4.509999999999841 | 26.07 | 45.466 | 78.509 |
| 4.514999999999842 | 26.188 | 45.694 | 78.942 |
| 4.519999999999841 | 26.306 | 45.923 | 79.377 |
| 4.524999999999841 | 26.424 | 46.153 | 79.815 |
| 4.529999999999841 | 26.543 | 46.385 | 80.255 |
| 4.534999999999841 | 26.663 | 46.617 | 80.698 |
| 4.53999999999984 | 26.783 | 46.851 | 81.143 |
| 4.544999999999841 | 26.904 | 47.086 | 81.59 |
| 4.54999999999984 | 27.025 | 47.321 | 82.04 |
| 4.554999999999841 | 27.147 | 47.559 | 82.493 |
| 4.55999999999984 | 27.269 | 47.797 | 82.947 |
| 4.564999999999841 | 27.392 | 48.037 | 83.405 |
| 4.56999999999984 | 27.516 | 48.277 | 83.865 |
| 4.57499999999984 | 27.64 | 48.519 | 84.327 |
| 4.57999999999984 | 27.764 | 48.762 | 84.792 |
| 4.58499999999984 | 27.89 | 49.007 | 85.26 |
| 4.58999999999984 | 28.015 | 49.252 | 85.73 |
| 4.59499999999984 | 28.142 | 49.499 | 86.203 |
| 4.59999999999984 | 28.268 | 49.747 | 86.678 |
| 4.60499999999984 | 28.396 | 49.996 | 87.156 |
| 4.60999999999984 | 28.524 | 50.247 | 87.637 |
| 4.614999999999839 | 28.652 | 50.499 | 88.12 |
| 4.61999999999984 | 28.782 | 50.752 | 88.606 |
| 4.624999999999839 | 28.911 | 51.006 | 89.095 |
| 4.62999999999984 | 29.042 | 51.262 | 89.586 |
| 4.634999999999839 | 29.173 | 51.519 | 90.08 |
| 4.639999999999838 | 29.304 | 51.777 | 90.577 |
| 4.644999999999839 | 29.436 | 52.036 | 91.076 |
| 4.649999999999838 | 29.569 | 52.297 | 91.579 |
| 4.654999999999839 | 29.702 | 52.559 | 92.084 |
| 4.659999999999838 | 29.836 | 52.823 | 92.592 |
| 4.664999999999838 | 29.971 | 53.088 | 93.102 |
| 4.669999999999838 | 30.106 | 53.354 | 93.616 |
| 4.674999999999838 | 30.241 | 53.621 | 94.132 |
| 4.679999999999837 | 30.378 | 53.89 | 94.651 |
| 4.684999999999838 | 30.515 | 54.16 | 95.173 |
| 4.689999999999837 | 30.652 | 54.431 | 95.698 |
| 4.694999999999838 | 30.79 | 54.704 | 96.226 |
| 4.699999999999837 | 30.929 | 54.978 | 96.756 |
| 4.704999999999837 | 31.069 | 55.254 | 97.29 |
| 4.709999999999837 | 31.209 | 55.531 | 97.826 |
| 4.714999999999837 | 31.35 | 55.809 | 98.366 |
| 4.719999999999837 | 31.491 | 56.089 | 98.908 |
| 4.724999999999837 | 31.633 | 56.37 | 99.454 |
| 4.729999999999836 | 31.775 | 56.652 | 100.002 |
| 4.734999999999836 | 31.919 | 56.936 | 100.554 |
| 4.739999999999836 | 32.063 | 57.221 | 101.108 |
| 4.744999999999836 | 32.207 | 57.508 | 101.666 |
| 4.749999999999836 | 32.352 | 57.796 | 102.227 |
| 4.754999999999836 | 32.498 | 58.086 | 102.79 |
| 4.759999999999836 | 32.645 | 58.377 | 103.357 |
| 4.764999999999836 | 32.792 | 58.67 | 103.927 |
| 4.769999999999836 | 32.94 | 58.964 | 104.5 |
| 4.774999999999835 | 33.088 | 59.259 | 105.077 |
| 4.779999999999835 | 33.237 | 59.556 | 105.656 |
| 4.784999999999835 | 33.387 | 59.855 | 106.239 |
| 4.789999999999835 | 33.538 | 60.155 | 106.825 |
| 4.794999999999835 | 33.689 | 60.456 | 107.414 |
| 4.799999999999835 | 33.841 | 60.759 | 108.006 |
| 4.804999999999835 | 33.993 | 61.064 | 108.602 |
| 4.809999999999835 | 34.147 | 61.37 | 109.201 |
| 4.814999999999835 | 34.301 | 61.677 | 109.803 |
| 4.819999999999835 | 34.455 | 61.987 | 110.409 |
| 4.824999999999835 | 34.611 | 62.297 | 111.017 |
| 4.829999999999834 | 34.767 | 62.609 | 111.63 |
| 4.834999999999834 | 34.923 | 62.923 | 112.245 |
| 4.839999999999834 | 35.081 | 63.239 | 112.864 |
| 4.844999999999834 | 35.239 | 63.556 | 113.487 |
| 4.849999999999834 | 35.398 | 63.874 | 114.113 |
| 4.854999999999834 | 35.558 | 64.194 | 114.742 |
| 4.859999999999834 | 35.718 | 64.516 | 115.375 |
| 4.864999999999834 | 35.879 | 64.839 | 116.011 |
| 4.869999999999834 | 36.041 | 65.164 | 116.651 |
| 4.874999999999834 | 36.203 | 65.491 | 117.294 |
| 4.879999999999833 | 36.366 | 65.819 | 117.941 |
| 4.884999999999834 | 36.53 | 66.149 | 118.591 |
| 4.889999999999833 | 36.695 | 66.481 | 119.245 |
| 4.894999999999833 | 36.861 | 66.814 | 119.903 |
| 4.899999999999833 | 37.027 | 67.149 | 120.564 |
| 4.904999999999833 | 37.194 | 67.485 | 121.229 |
| 4.909999999999833 | 37.361 | 67.823 | 121.898 |
| 4.914999999999833 | 37.53 | 68.163 | 122.57 |
| 4.919999999999832 | 37.699 | 68.505 | 123.246 |
| 4.924999999999833 | 37.869 | 68.848 | 123.926 |
| 4.929999999999832 | 38.04 | 69.193 | 124.609 |
| 4.934999999999832 | 38.211 | 69.54 | 125.296 |
| 4.939999999999832 | 38.384 | 69.889 | 125.987 |
| 4.944999999999832 | 38.557 | 70.239 | 126.682 |
| 4.949999999999832 | 38.73 | 70.591 | 127.381 |
| 4.954999999999832 | 38.905 | 70.945 | 128.083 |
| 4.959999999999832 | 39.081 | 71.3 | 128.79 |
| 4.964999999999832 | 39.257 | 71.658 | 129.5 |
| 4.969999999999831 | 39.434 | 72.017 | 130.214 |
| 4.974999999999831 | 39.612 | 72.378 | 130.932 |
| 4.97999999999983 | 39.79 | 72.741 | 131.654 |
| 4.984999999999831 | 39.97 | 73.105 | 132.38 |
| 4.98999999999983 | 40.15 | 73.472 | 133.111 |
| 4.994999999999831 | 40.331 | 73.84 | 133.845 |
| 4.99999999999983 | 40.513 | 74.21 | 134.583 |